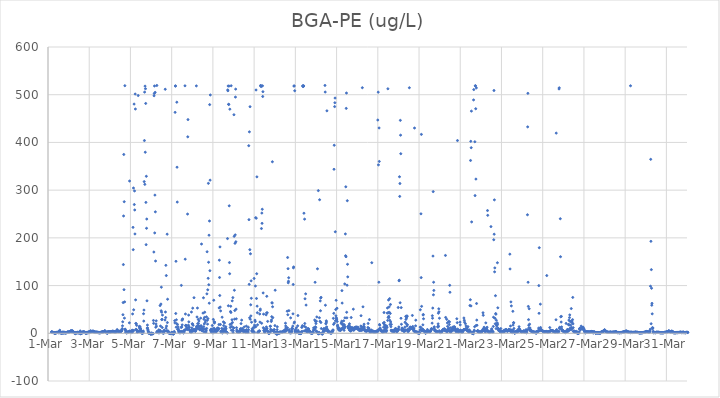
| Category | BGA-PE (ug/L) |
|---|---|
| 44986.166666666664 | 2.65 |
| 44986.177083333336 | 3.21 |
| 44986.1875 | 2.46 |
| 44986.197916666664 | 2.22 |
| 44986.208333333336 | 2.46 |
| 44986.21875 | 1.92 |
| 44986.229166666664 | 2.02 |
| 44986.239583333336 | 1.4 |
| 44986.25 | 1.86 |
| 44986.260416666664 | 1.52 |
| 44986.270833333336 | 1.32 |
| 44986.28125 | 1.61 |
| 44986.291666666664 | 1.69 |
| 44986.302083333336 | 1.04 |
| 44986.3125 | 0.11 |
| 44986.322916666664 | -0.11 |
| 44986.333333333336 | -0.01 |
| 44986.34375 | 0.42 |
| 44986.354166666664 | 1.64 |
| 44986.364583333336 | 0.75 |
| 44986.375 | 0.01 |
| 44986.385416666664 | 0.7 |
| 44986.395833333336 | 0.99 |
| 44986.40625 | 1.82 |
| 44986.416666666664 | 1.62 |
| 44986.427083333336 | 1.99 |
| 44986.4375 | 1.64 |
| 44986.447916666664 | 1.62 |
| 44986.458333333336 | 1.69 |
| 44986.46875 | 2.15 |
| 44986.479166666664 | 1.99 |
| 44986.489583333336 | 1.51 |
| 44986.5 | 2.55 |
| 44986.510416666664 | 2.75 |
| 44986.520833333336 | 3.06 |
| 44986.53125 | 0.52 |
| 44986.541666666664 | 2.72 |
| 44986.552083333336 | 3.44 |
| 44986.5625 | 3.37 |
| 44986.572916666664 | 6.44 |
| 44986.583333333336 | 2.01 |
| 44986.59375 | 1.48 |
| 44986.604166666664 | 1.84 |
| 44986.614583333336 | 1.39 |
| 44986.625 | 1.01 |
| 44986.635416666664 | 0.01 |
| 44986.645833333336 | 0.04 |
| 44986.65625 | 0.87 |
| 44986.666666666664 | 1.49 |
| 44986.677083333336 | 1.1 |
| 44986.6875 | 0.36 |
| 44986.697916666664 | 0.08 |
| 44986.708333333336 | 1.91 |
| 44986.71875 | 2.59 |
| 44986.729166666664 | 1.92 |
| 44986.739583333336 | 1.44 |
| 44986.75 | 1.84 |
| 44986.760416666664 | 0 |
| 44986.770833333336 | 2.47 |
| 44986.78125 | 2.14 |
| 44986.791666666664 | 1.79 |
| 44986.802083333336 | 0.89 |
| 44986.8125 | 1.61 |
| 44986.822916666664 | 1.21 |
| 44986.833333333336 | 1.58 |
| 44986.84375 | 0.33 |
| 44986.854166666664 | 0.81 |
| 44986.864583333336 | 0.7 |
| 44986.875 | 1.85 |
| 44986.885416666664 | 1.7 |
| 44986.895833333336 | 1.17 |
| 44986.90625 | 1.28 |
| 44986.916666666664 | 1.2 |
| 44986.927083333336 | 1.82 |
| 44986.9375 | 2.34 |
| 44986.947916666664 | 2.77 |
| 44986.958333333336 | 2.48 |
| 44986.96875 | 2.37 |
| 44986.979166666664 | 2.29 |
| 44986.989583333336 | 1.8 |
| 44987.0 | 2.6 |
| 44987.010416666664 | 2.54 |
| 44987.020833333336 | 3.18 |
| 44987.03125 | 2.92 |
| 44987.041666666664 | 3.11 |
| 44987.052083333336 | 3.05 |
| 44987.0625 | 3.44 |
| 44987.072916666664 | 3.9 |
| 44987.083333333336 | 4.03 |
| 44987.09375 | 3.89 |
| 44987.104166666664 | 5.21 |
| 44987.114583333336 | 4.47 |
| 44987.125 | 4.93 |
| 44987.135416666664 | 4.74 |
| 44987.145833333336 | 3.46 |
| 44987.15625 | 4.66 |
| 44987.166666666664 | 5.26 |
| 44987.177083333336 | 4.96 |
| 44987.1875 | 4.36 |
| 44987.197916666664 | 3.9 |
| 44987.208333333336 | 4.48 |
| 44987.21875 | 2.83 |
| 44987.229166666664 | 2.71 |
| 44987.239583333336 | 2.36 |
| 44987.25 | 2.07 |
| 44987.260416666664 | 1.85 |
| 44987.270833333336 | 0.59 |
| 44987.28125 | 1.47 |
| 44987.291666666664 | 0.73 |
| 44987.302083333336 | 0.65 |
| 44987.3125 | 0.38 |
| 44987.322916666664 | 0.08 |
| 44987.333333333336 | -0.8 |
| 44987.34375 | 1.55 |
| 44987.354166666664 | 0.52 |
| 44987.364583333336 | 1.13 |
| 44987.375 | 1.46 |
| 44987.385416666664 | 0.87 |
| 44987.395833333336 | 1.6 |
| 44987.40625 | 0.56 |
| 44987.416666666664 | 1.18 |
| 44987.427083333336 | 2.3 |
| 44987.4375 | 1.37 |
| 44987.447916666664 | 1.34 |
| 44987.458333333336 | 1.51 |
| 44987.46875 | 0.94 |
| 44987.479166666664 | 1.13 |
| 44987.489583333336 | 1.14 |
| 44987.5 | 0.95 |
| 44987.510416666664 | 1.22 |
| 44987.520833333336 | 1.56 |
| 44987.53125 | 1.76 |
| 44987.541666666664 | 0.38 |
| 44987.552083333336 | 1.67 |
| 44987.5625 | 5.04 |
| 44987.572916666664 | -1.1 |
| 44987.583333333336 | -0.13 |
| 44987.59375 | 0.17 |
| 44987.604166666664 | -0.16 |
| 44987.614583333336 | -0.27 |
| 44987.625 | -0.41 |
| 44987.635416666664 | 0.72 |
| 44987.645833333336 | 2.03 |
| 44987.65625 | 2.16 |
| 44987.666666666664 | 1.69 |
| 44987.677083333336 | 1.94 |
| 44987.6875 | 0.82 |
| 44987.697916666664 | 3.33 |
| 44987.708333333336 | 3.11 |
| 44987.71875 | 2.38 |
| 44987.729166666664 | 2.21 |
| 44987.739583333336 | 2.67 |
| 44987.75 | 2.46 |
| 44987.760416666664 | 2.42 |
| 44987.770833333336 | 2.4 |
| 44987.78125 | 2.02 |
| 44987.791666666664 | 2.4 |
| 44987.802083333336 | 1.1 |
| 44987.8125 | 1.39 |
| 44987.822916666664 | -0.25 |
| 44987.833333333336 | 1.07 |
| 44987.84375 | 1.47 |
| 44987.854166666664 | 0.29 |
| 44987.864583333336 | -0.19 |
| 44987.875 | 1.67 |
| 44987.885416666664 | 1.14 |
| 44987.895833333336 | 2.25 |
| 44987.90625 | 0.78 |
| 44987.916666666664 | 1.25 |
| 44987.927083333336 | 1.78 |
| 44987.9375 | 2.05 |
| 44987.947916666664 | 2.3 |
| 44987.958333333336 | 2.49 |
| 44987.96875 | 2.41 |
| 44987.979166666664 | 1.01 |
| 44987.989583333336 | 3.1 |
| 44988.0 | 1.34 |
| 44988.010416666664 | 2.17 |
| 44988.020833333336 | 2.51 |
| 44988.03125 | 2.75 |
| 44988.041666666664 | 2.16 |
| 44988.052083333336 | 4.57 |
| 44988.0625 | 4.63 |
| 44988.072916666664 | 3.98 |
| 44988.083333333336 | 4.91 |
| 44988.09375 | 3.74 |
| 44988.104166666664 | 3.57 |
| 44988.114583333336 | 3.41 |
| 44988.125 | 3.36 |
| 44988.135416666664 | 3.49 |
| 44988.145833333336 | 3.49 |
| 44988.15625 | 3.7 |
| 44988.166666666664 | 4.65 |
| 44988.177083333336 | 3.83 |
| 44988.1875 | 4.57 |
| 44988.197916666664 | 3.36 |
| 44988.208333333336 | 4.19 |
| 44988.21875 | 3.1 |
| 44988.229166666664 | 2.91 |
| 44988.239583333336 | 2.8 |
| 44988.25 | 2.64 |
| 44988.260416666664 | 2.56 |
| 44988.270833333336 | 2.18 |
| 44988.28125 | 2.68 |
| 44988.291666666664 | 2.24 |
| 44988.302083333336 | 2.65 |
| 44988.3125 | 2.02 |
| 44988.322916666664 | 1.62 |
| 44988.333333333336 | 1.99 |
| 44988.34375 | 2.38 |
| 44988.354166666664 | 2.13 |
| 44988.364583333336 | 2.04 |
| 44988.375 | 2.45 |
| 44988.385416666664 | 1.96 |
| 44988.395833333336 | 2 |
| 44988.40625 | 2.09 |
| 44988.416666666664 | 1.52 |
| 44988.427083333336 | 1.89 |
| 44988.4375 | 2.07 |
| 44988.447916666664 | 1.43 |
| 44988.458333333336 | 1.2 |
| 44988.46875 | 1.32 |
| 44988.479166666664 | 1.57 |
| 44988.489583333336 | 1.57 |
| 44988.5 | 0.94 |
| 44988.510416666664 | 0.91 |
| 44988.520833333336 | 1.27 |
| 44988.53125 | 0.91 |
| 44988.541666666664 | 1.95 |
| 44988.552083333336 | 1.36 |
| 44988.5625 | 1.92 |
| 44988.572916666664 | 1.5 |
| 44988.583333333336 | 2.46 |
| 44988.59375 | 2.43 |
| 44988.604166666664 | 2.22 |
| 44988.614583333336 | 2.14 |
| 44988.625 | 2.2 |
| 44988.635416666664 | 2.41 |
| 44988.645833333336 | 3.56 |
| 44988.65625 | 2.94 |
| 44988.666666666664 | 2.37 |
| 44988.677083333336 | 3.59 |
| 44988.6875 | 3.09 |
| 44988.697916666664 | 3.27 |
| 44988.708333333336 | 3.29 |
| 44988.71875 | 3.32 |
| 44988.729166666664 | 3.96 |
| 44988.739583333336 | 4.48 |
| 44988.75 | 4.94 |
| 44988.760416666664 | 5.27 |
| 44988.770833333336 | 4.58 |
| 44988.78125 | 3.84 |
| 44988.791666666664 | 3.78 |
| 44988.802083333336 | 2.95 |
| 44988.8125 | 2.11 |
| 44988.822916666664 | 1.61 |
| 44988.833333333336 | 0.95 |
| 44988.84375 | 1.76 |
| 44988.854166666664 | 1.3 |
| 44988.864583333336 | 1.98 |
| 44988.875 | -0.17 |
| 44988.885416666664 | 0.38 |
| 44988.895833333336 | 2.94 |
| 44988.90625 | 2.83 |
| 44988.916666666664 | 3.31 |
| 44988.927083333336 | 3.21 |
| 44988.9375 | 3.32 |
| 44988.947916666664 | 3.01 |
| 44988.958333333336 | 2.53 |
| 44988.96875 | 3.06 |
| 44988.979166666664 | 3.12 |
| 44988.989583333336 | 3.02 |
| 44989.0 | 3.16 |
| 44989.010416666664 | 2 |
| 44989.020833333336 | 2.98 |
| 44989.03125 | 2.76 |
| 44989.041666666664 | 3 |
| 44989.052083333336 | 3.13 |
| 44989.0625 | 3.1 |
| 44989.072916666664 | 3.66 |
| 44989.083333333336 | 3.66 |
| 44989.09375 | 3.22 |
| 44989.104166666664 | 3.3 |
| 44989.114583333336 | 3.47 |
| 44989.125 | 4.69 |
| 44989.135416666664 | 3.35 |
| 44989.145833333336 | 3.95 |
| 44989.15625 | 3.61 |
| 44989.166666666664 | 4.32 |
| 44989.177083333336 | 3.55 |
| 44989.1875 | 3.57 |
| 44989.197916666664 | 2.7 |
| 44989.208333333336 | 3.17 |
| 44989.21875 | 3.1 |
| 44989.229166666664 | 3.5 |
| 44989.239583333336 | 3.1 |
| 44989.25 | 2.36 |
| 44989.260416666664 | 2.83 |
| 44989.270833333336 | 3.49 |
| 44989.28125 | 3.33 |
| 44989.291666666664 | 2.37 |
| 44989.302083333336 | 2.75 |
| 44989.3125 | 3.56 |
| 44989.322916666664 | 4.86 |
| 44989.333333333336 | 5.21 |
| 44989.34375 | 5.58 |
| 44989.354166666664 | 7.77 |
| 44989.364583333336 | 5.84 |
| 44989.375 | 4.72 |
| 44989.385416666664 | 4.54 |
| 44989.395833333336 | 4.49 |
| 44989.40625 | 4.36 |
| 44989.416666666664 | 3.86 |
| 44989.427083333336 | 3.71 |
| 44989.4375 | 3.53 |
| 44989.447916666664 | 4.09 |
| 44989.458333333336 | 4.21 |
| 44989.46875 | 3.83 |
| 44989.479166666664 | 3.75 |
| 44989.489583333336 | 4.05 |
| 44989.5 | 3.93 |
| 44989.510416666664 | 3.65 |
| 44989.520833333336 | 4.3 |
| 44989.53125 | 4.52 |
| 44989.541666666664 | 4.03 |
| 44989.552083333336 | 4.29 |
| 44989.5625 | 4.92 |
| 44989.572916666664 | 5.7 |
| 44989.583333333336 | 7.57 |
| 44989.59375 | 7 |
| 44989.604166666664 | 9.82 |
| 44989.614583333336 | 15.61 |
| 44989.625 | 24.05 |
| 44989.635416666664 | 38.92 |
| 44989.645833333336 | 64.4 |
| 44989.65625 | 144.03 |
| 44989.666666666664 | 245.85 |
| 44989.677083333336 | 374.78 |
| 44989.6875 | 91.42 |
| 44989.697916666664 | 275.77 |
| 44989.708333333336 | 31.78 |
| 44989.71875 | 65.8 |
| 44989.729166666664 | 518.9 |
| 44989.739583333336 | 8.64 |
| 44989.75 | 7.96 |
| 44989.760416666664 | 6.03 |
| 44989.770833333336 | 2.11 |
| 44989.78125 | 3.01 |
| 44989.791666666664 | 2.38 |
| 44989.802083333336 | 3.67 |
| 44989.8125 | 1.01 |
| 44989.822916666664 | 0.64 |
| 44989.833333333336 | 2.15 |
| 44989.84375 | 1.63 |
| 44989.854166666664 | 1.84 |
| 44989.864583333336 | 2.96 |
| 44989.875 | 2.8 |
| 44989.885416666664 | 2.49 |
| 44989.895833333336 | 2.37 |
| 44989.90625 | 2.85 |
| 44989.916666666664 | 2.67 |
| 44989.927083333336 | 3.3 |
| 44989.9375 | 4.19 |
| 44989.947916666664 | 21.91 |
| 44989.958333333336 | 319.12 |
| 44989.96875 | 4.84 |
| 44989.979166666664 | 2.32 |
| 44989.989583333336 | 3.36 |
| 44990.0 | 2.5 |
| 44990.010416666664 | 3.06 |
| 44990.020833333336 | 1.87 |
| 44990.03125 | 1.73 |
| 44990.041666666664 | 2 |
| 44990.052083333336 | 1.8 |
| 44990.0625 | 1.36 |
| 44990.072916666664 | 2 |
| 44990.083333333336 | 6.52 |
| 44990.09375 | 5.81 |
| 44990.104166666664 | 40.53 |
| 44990.114583333336 | 3.84 |
| 44990.125 | 221.97 |
| 44990.135416666664 | 175.24 |
| 44990.145833333336 | 304.45 |
| 44990.15625 | 49.2 |
| 44990.166666666664 | 6.11 |
| 44990.177083333336 | 480.39 |
| 44990.1875 | 269.82 |
| 44990.197916666664 | 298.39 |
| 44990.208333333336 | 258.45 |
| 44990.21875 | 208.17 |
| 44990.229166666664 | 501.42 |
| 44990.239583333336 | 470.03 |
| 44990.25 | 69.97 |
| 44990.260416666664 | 20.74 |
| 44990.270833333336 | 8.58 |
| 44990.28125 | 19.97 |
| 44990.291666666664 | 7.06 |
| 44990.302083333336 | 16.57 |
| 44990.3125 | 6.4 |
| 44990.322916666664 | 2.89 |
| 44990.333333333336 | 2.33 |
| 44990.34375 | 2.75 |
| 44990.354166666664 | 2.98 |
| 44990.364583333336 | 3.37 |
| 44990.375 | 498.29 |
| 44990.385416666664 | 4.03 |
| 44990.395833333336 | 3.64 |
| 44990.40625 | 4.28 |
| 44990.416666666664 | 3.75 |
| 44990.427083333336 | 13.27 |
| 44990.4375 | 14.59 |
| 44990.447916666664 | 10.23 |
| 44990.458333333336 | 13.56 |
| 44990.46875 | 12.9 |
| 44990.479166666664 | 9.9 |
| 44990.489583333336 | 9.27 |
| 44990.5 | 6.28 |
| 44990.510416666664 | 6.41 |
| 44990.520833333336 | 4.35 |
| 44990.53125 | 3.74 |
| 44990.541666666664 | 2.86 |
| 44990.552083333336 | 0.06 |
| 44990.5625 | 0.25 |
| 44990.572916666664 | 0.98 |
| 44990.583333333336 | 0.39 |
| 44990.59375 | -0.22 |
| 44990.604166666664 | 3.86 |
| 44990.614583333336 | 1.67 |
| 44990.625 | 4.6 |
| 44990.635416666664 | 40.98 |
| 44990.645833333336 | 25.55 |
| 44990.65625 | 48.69 |
| 44990.666666666664 | 317.88 |
| 44990.677083333336 | 403.95 |
| 44990.6875 | 505.45 |
| 44990.697916666664 | 312.11 |
| 44990.708333333336 | 517.99 |
| 44990.71875 | 379.49 |
| 44990.729166666664 | 512.59 |
| 44990.739583333336 | 481.73 |
| 44990.75 | 274.3 |
| 44990.760416666664 | 185.74 |
| 44990.770833333336 | 329.02 |
| 44990.78125 | 220.04 |
| 44990.791666666664 | 239.44 |
| 44990.802083333336 | 68.03 |
| 44990.8125 | 10.92 |
| 44990.822916666664 | 17.24 |
| 44990.833333333336 | 11.04 |
| 44990.84375 | 7.66 |
| 44990.854166666664 | 5.91 |
| 44990.864583333336 | 3.51 |
| 44990.875 | 0.44 |
| 44990.885416666664 | 0.32 |
| 44990.895833333336 | 1.13 |
| 44990.90625 | 0.56 |
| 44990.916666666664 | 0.13 |
| 44990.927083333336 | 0.63 |
| 44990.9375 | 0.2 |
| 44990.947916666664 | 0.55 |
| 44990.958333333336 | -0.44 |
| 44990.96875 | -1.34 |
| 44990.979166666664 | -1.2 |
| 44990.989583333336 | -1.79 |
| 44991.0 | -1.29 |
| 44991.010416666664 | -1.83 |
| 44991.020833333336 | -0.73 |
| 44991.03125 | 0.71 |
| 44991.041666666664 | -0.02 |
| 44991.052083333336 | -0.14 |
| 44991.0625 | -0.71 |
| 44991.072916666664 | -1.3 |
| 44991.083333333336 | -1 |
| 44991.09375 | -0.72 |
| 44991.104166666664 | -0.79 |
| 44991.114583333336 | 26.86 |
| 44991.125 | 20.79 |
| 44991.135416666664 | 170.3 |
| 44991.145833333336 | 497.78 |
| 44991.15625 | 502.53 |
| 44991.166666666664 | 518.32 |
| 44991.177083333336 | 210.35 |
| 44991.1875 | 289.61 |
| 44991.197916666664 | 504.91 |
| 44991.208333333336 | 254.52 |
| 44991.21875 | 151.47 |
| 44991.229166666664 | 12.63 |
| 44991.239583333336 | 19.53 |
| 44991.25 | 26.09 |
| 44991.260416666664 | 14.97 |
| 44991.270833333336 | 1.97 |
| 44991.28125 | 519.37 |
| 44991.291666666664 | 4.08 |
| 44991.302083333336 | 1.91 |
| 44991.3125 | 2.27 |
| 44991.322916666664 | 2.67 |
| 44991.333333333336 | 1.9 |
| 44991.34375 | 1.92 |
| 44991.354166666664 | 1.51 |
| 44991.364583333336 | 1.08 |
| 44991.375 | 7.2 |
| 44991.385416666664 | 2.48 |
| 44991.395833333336 | 0.89 |
| 44991.40625 | 2.73 |
| 44991.416666666664 | 6.02 |
| 44991.427083333336 | 5.08 |
| 44991.4375 | 58.11 |
| 44991.447916666664 | 5.6 |
| 44991.458333333336 | 15.16 |
| 44991.46875 | 3.37 |
| 44991.479166666664 | 61.28 |
| 44991.489583333336 | 47.13 |
| 44991.5 | 96.57 |
| 44991.510416666664 | 44.29 |
| 44991.520833333336 | 28.54 |
| 44991.53125 | 29.37 |
| 44991.541666666664 | 12.07 |
| 44991.552083333336 | 38.17 |
| 44991.5625 | 3.33 |
| 44991.572916666664 | 0.59 |
| 44991.583333333336 | 0.57 |
| 44991.59375 | 0.65 |
| 44991.604166666664 | 0.77 |
| 44991.614583333336 | 1.05 |
| 44991.625 | 0.47 |
| 44991.635416666664 | 6.55 |
| 44991.645833333336 | 4.7 |
| 44991.65625 | 4.84 |
| 44991.666666666664 | 5.19 |
| 44991.677083333336 | 27.82 |
| 44991.6875 | 511.41 |
| 44991.697916666664 | 44.58 |
| 44991.708333333336 | 32.98 |
| 44991.71875 | 142.45 |
| 44991.729166666664 | 10.9 |
| 44991.739583333336 | 120.94 |
| 44991.75 | 15.14 |
| 44991.760416666664 | 5.21 |
| 44991.770833333336 | 4.63 |
| 44991.78125 | 207.72 |
| 44991.791666666664 | 22.5 |
| 44991.802083333336 | 71.37 |
| 44991.8125 | 4.96 |
| 44991.822916666664 | 4.67 |
| 44991.833333333336 | 2.73 |
| 44991.84375 | 2.08 |
| 44991.854166666664 | 0.78 |
| 44991.864583333336 | 1.33 |
| 44991.875 | 0.93 |
| 44991.885416666664 | 0.1 |
| 44991.895833333336 | -0.13 |
| 44991.90625 | 0.2 |
| 44991.916666666664 | -0.44 |
| 44991.927083333336 | -0.47 |
| 44991.9375 | -0.72 |
| 44991.947916666664 | -0.3 |
| 44991.958333333336 | -0.4 |
| 44991.96875 | -0.46 |
| 44991.979166666664 | 1.31 |
| 44991.989583333336 | 0.9 |
| 44992.0 | 1.02 |
| 44992.010416666664 | 0.68 |
| 44992.020833333336 | 1.54 |
| 44992.03125 | 1.61 |
| 44992.041666666664 | 0.64 |
| 44992.052083333336 | -0.17 |
| 44992.0625 | -0.99 |
| 44992.072916666664 | -1.92 |
| 44992.083333333336 | -0.41 |
| 44992.09375 | -1.26 |
| 44992.104166666664 | -0.68 |
| 44992.114583333336 | 0.69 |
| 44992.125 | 3.73 |
| 44992.135416666664 | 1.41 |
| 44992.145833333336 | 26.33 |
| 44992.15625 | 21.73 |
| 44992.166666666664 | 463.06 |
| 44992.177083333336 | 518.3 |
| 44992.1875 | 518.28 |
| 44992.197916666664 | 41.48 |
| 44992.208333333336 | 150.86 |
| 44992.21875 | 12.74 |
| 44992.229166666664 | 28.23 |
| 44992.239583333336 | 20.29 |
| 44992.25 | 484.32 |
| 44992.260416666664 | 348.06 |
| 44992.270833333336 | 274.99 |
| 44992.28125 | 18.41 |
| 44992.291666666664 | 8.28 |
| 44992.302083333336 | 8.33 |
| 44992.3125 | 13.35 |
| 44992.322916666664 | 9.05 |
| 44992.333333333336 | 6.26 |
| 44992.34375 | 3.52 |
| 44992.354166666664 | 2.85 |
| 44992.364583333336 | 2.1 |
| 44992.375 | 1.2 |
| 44992.385416666664 | 4.1 |
| 44992.395833333336 | 1.26 |
| 44992.40625 | 1.42 |
| 44992.416666666664 | 1.31 |
| 44992.427083333336 | 1.42 |
| 44992.4375 | 2.77 |
| 44992.447916666664 | 3.35 |
| 44992.458333333336 | 12.26 |
| 44992.46875 | 100.4 |
| 44992.479166666664 | 3.82 |
| 44992.489583333336 | 13.08 |
| 44992.5 | 27.41 |
| 44992.510416666664 | 17.62 |
| 44992.520833333336 | 28.79 |
| 44992.53125 | 30.12 |
| 44992.541666666664 | 4.03 |
| 44992.552083333336 | 1.55 |
| 44992.5625 | 1.24 |
| 44992.572916666664 | 0.82 |
| 44992.583333333336 | 1.25 |
| 44992.59375 | 2.22 |
| 44992.604166666664 | 4.28 |
| 44992.614583333336 | 6.09 |
| 44992.625 | 6.16 |
| 44992.635416666664 | 6.9 |
| 44992.645833333336 | 518.68 |
| 44992.65625 | 155.31 |
| 44992.666666666664 | 40.41 |
| 44992.677083333336 | 16.08 |
| 44992.6875 | 16.74 |
| 44992.697916666664 | 15.61 |
| 44992.708333333336 | 15.28 |
| 44992.71875 | 8.96 |
| 44992.729166666664 | 11.01 |
| 44992.739583333336 | 11.61 |
| 44992.75 | 8.92 |
| 44992.760416666664 | 7.7 |
| 44992.770833333336 | 249.86 |
| 44992.78125 | 411.74 |
| 44992.791666666664 | 447.84 |
| 44992.802083333336 | 11.77 |
| 44992.8125 | 16.97 |
| 44992.822916666664 | 38.1 |
| 44992.833333333336 | 23.99 |
| 44992.84375 | 12.93 |
| 44992.854166666664 | 12.5 |
| 44992.864583333336 | 7.28 |
| 44992.875 | 6.88 |
| 44992.885416666664 | 5.96 |
| 44992.895833333336 | 4.95 |
| 44992.90625 | 4.15 |
| 44992.916666666664 | 2.59 |
| 44992.927083333336 | 2.26 |
| 44992.9375 | 1.73 |
| 44992.947916666664 | 1.5 |
| 44992.958333333336 | 44.55 |
| 44992.96875 | 6.13 |
| 44992.979166666664 | 11.12 |
| 44992.989583333336 | 5.85 |
| 44993.0 | 20.01 |
| 44993.010416666664 | 19.32 |
| 44993.020833333336 | 52.68 |
| 44993.03125 | 4.23 |
| 44993.041666666664 | 16.76 |
| 44993.052083333336 | 6.59 |
| 44993.0625 | 6.97 |
| 44993.072916666664 | 8.04 |
| 44993.083333333336 | 74.61 |
| 44993.09375 | 6.68 |
| 44993.104166666664 | 6.62 |
| 44993.114583333336 | 6.68 |
| 44993.125 | 5.89 |
| 44993.135416666664 | 6.52 |
| 44993.145833333336 | 3.91 |
| 44993.15625 | 5.29 |
| 44993.166666666664 | 5.23 |
| 44993.177083333336 | 9.49 |
| 44993.1875 | 9.77 |
| 44993.197916666664 | 518.48 |
| 44993.208333333336 | 14.25 |
| 44993.21875 | 13.38 |
| 44993.229166666664 | 34.21 |
| 44993.239583333336 | 9.3 |
| 44993.25 | 52.91 |
| 44993.260416666664 | 20.2 |
| 44993.270833333336 | 14.56 |
| 44993.28125 | 15.32 |
| 44993.291666666664 | 29.14 |
| 44993.302083333336 | 20.58 |
| 44993.3125 | 13 |
| 44993.322916666664 | 25.76 |
| 44993.333333333336 | 14.58 |
| 44993.34375 | 8.65 |
| 44993.354166666664 | 8.94 |
| 44993.364583333336 | 7.66 |
| 44993.375 | 7.01 |
| 44993.385416666664 | 15.05 |
| 44993.395833333336 | 9.33 |
| 44993.40625 | 31.69 |
| 44993.416666666664 | 8.93 |
| 44993.427083333336 | 15.73 |
| 44993.4375 | 14.64 |
| 44993.447916666664 | 187.03 |
| 44993.458333333336 | 10.78 |
| 44993.46875 | 10.88 |
| 44993.479166666664 | 5.11 |
| 44993.489583333336 | 5.55 |
| 44993.5 | 7.52 |
| 44993.510416666664 | 8.77 |
| 44993.520833333336 | 42.3 |
| 44993.53125 | 8.18 |
| 44993.541666666664 | 74.4 |
| 44993.552083333336 | 13.61 |
| 44993.5625 | 29.55 |
| 44993.572916666664 | 2.77 |
| 44993.583333333336 | 19.58 |
| 44993.59375 | 33.29 |
| 44993.604166666664 | 44.16 |
| 44993.614583333336 | 8.3 |
| 44993.625 | 23.02 |
| 44993.635416666664 | 2.62 |
| 44993.645833333336 | 26.67 |
| 44993.65625 | 8.94 |
| 44993.666666666664 | 2.51 |
| 44993.677083333336 | 5.32 |
| 44993.6875 | 34.47 |
| 44993.697916666664 | 10.03 |
| 44993.708333333336 | 82.65 |
| 44993.71875 | 170.86 |
| 44993.729166666664 | 27.09 |
| 44993.739583333336 | 19.18 |
| 44993.75 | 91.12 |
| 44993.760416666664 | 30.78 |
| 44993.770833333336 | 115.21 |
| 44993.78125 | 314.24 |
| 44993.791666666664 | 148.8 |
| 44993.802083333336 | 101.78 |
| 44993.8125 | 205.57 |
| 44993.822916666664 | 63.09 |
| 44993.833333333336 | 235.35 |
| 44993.84375 | 479.24 |
| 44993.854166666664 | 131.16 |
| 44993.864583333336 | 320.92 |
| 44993.875 | 499.49 |
| 44993.885416666664 | 6.77 |
| 44993.895833333336 | 6.44 |
| 44993.90625 | 3.24 |
| 44993.916666666664 | 8.8 |
| 44993.927083333336 | 5.25 |
| 44993.9375 | 7.38 |
| 44993.947916666664 | 2.79 |
| 44993.958333333336 | 3.35 |
| 44993.96875 | 16.32 |
| 44993.979166666664 | 1.18 |
| 44993.989583333336 | 8.74 |
| 44994.0 | 2.46 |
| 44994.010416666664 | 4.15 |
| 44994.020833333336 | 29.04 |
| 44994.03125 | 1.25 |
| 44994.041666666664 | 69.24 |
| 44994.052083333336 | 10.78 |
| 44994.0625 | 24.08 |
| 44994.072916666664 | 21.48 |
| 44994.083333333336 | 23.3 |
| 44994.09375 | 6.67 |
| 44994.104166666664 | 7.33 |
| 44994.114583333336 | 7.5 |
| 44994.125 | 3.59 |
| 44994.135416666664 | 3.62 |
| 44994.145833333336 | 2.71 |
| 44994.15625 | 3.59 |
| 44994.166666666664 | 3.48 |
| 44994.177083333336 | 5.1 |
| 44994.1875 | 6.36 |
| 44994.197916666664 | 6.48 |
| 44994.208333333336 | 5.84 |
| 44994.21875 | 11.17 |
| 44994.229166666664 | 9.23 |
| 44994.239583333336 | 9.79 |
| 44994.25 | 6.46 |
| 44994.260416666664 | 9.52 |
| 44994.270833333336 | 10.62 |
| 44994.28125 | 9 |
| 44994.291666666664 | 18.3 |
| 44994.302083333336 | 53.13 |
| 44994.3125 | 153.21 |
| 44994.322916666664 | 116.94 |
| 44994.333333333336 | 79.18 |
| 44994.34375 | 181.03 |
| 44994.354166666664 | 54.91 |
| 44994.364583333336 | 18.46 |
| 44994.375 | 46.9 |
| 44994.385416666664 | 3.31 |
| 44994.395833333336 | 3.86 |
| 44994.40625 | 1.68 |
| 44994.416666666664 | 4.66 |
| 44994.427083333336 | 10.03 |
| 44994.4375 | 4.64 |
| 44994.447916666664 | 33.7 |
| 44994.458333333336 | 0.44 |
| 44994.46875 | 3.33 |
| 44994.479166666664 | 5.64 |
| 44994.489583333336 | 2.73 |
| 44994.5 | 9.41 |
| 44994.510416666664 | 23.92 |
| 44994.520833333336 | 16.16 |
| 44994.53125 | 4.22 |
| 44994.541666666664 | 7.23 |
| 44994.552083333336 | 3.63 |
| 44994.5625 | 21.72 |
| 44994.572916666664 | 6.57 |
| 44994.583333333336 | 9.84 |
| 44994.59375 | 9.85 |
| 44994.604166666664 | 5.39 |
| 44994.614583333336 | 8.05 |
| 44994.625 | 13.67 |
| 44994.635416666664 | 9.97 |
| 44994.645833333336 | 2.2 |
| 44994.65625 | 2.32 |
| 44994.666666666664 | 1.8 |
| 44994.677083333336 | 1.82 |
| 44994.6875 | 1.32 |
| 44994.697916666664 | 0.5 |
| 44994.708333333336 | 198.44 |
| 44994.71875 | 510.07 |
| 44994.729166666664 | 508.3 |
| 44994.739583333336 | 518.28 |
| 44994.75 | 57.68 |
| 44994.760416666664 | 479.9 |
| 44994.770833333336 | 479.47 |
| 44994.78125 | 518.12 |
| 44994.791666666664 | 267.15 |
| 44994.802083333336 | 148.21 |
| 44994.8125 | 124.84 |
| 44994.822916666664 | 469.69 |
| 44994.833333333336 | 18.4 |
| 44994.84375 | 12.18 |
| 44994.854166666664 | 45.57 |
| 44994.864583333336 | 56.67 |
| 44994.875 | 43.64 |
| 44994.885416666664 | 518.76 |
| 44994.895833333336 | 6.31 |
| 44994.90625 | 20.35 |
| 44994.916666666664 | 14.19 |
| 44994.927083333336 | 28.34 |
| 44994.9375 | 67.95 |
| 44994.947916666664 | 22.72 |
| 44994.958333333336 | 6.65 |
| 44994.96875 | 74.77 |
| 44994.979166666664 | 1.3 |
| 44994.989583333336 | 5.49 |
| 44995.0 | 11.35 |
| 44995.010416666664 | 11.44 |
| 44995.020833333336 | 458.05 |
| 44995.03125 | 203.2 |
| 44995.041666666664 | 90.13 |
| 44995.052083333336 | 29.67 |
| 44995.0625 | 47.76 |
| 44995.072916666664 | 188.52 |
| 44995.083333333336 | 206.26 |
| 44995.09375 | 495.02 |
| 44995.104166666664 | 511.7 |
| 44995.114583333336 | 191.83 |
| 44995.125 | 50.6 |
| 44995.135416666664 | 30.33 |
| 44995.145833333336 | 11.77 |
| 44995.15625 | 6.79 |
| 44995.166666666664 | 4.05 |
| 44995.177083333336 | 2.85 |
| 44995.1875 | 3.13 |
| 44995.197916666664 | 3.22 |
| 44995.208333333336 | 2.54 |
| 44995.21875 | 2.83 |
| 44995.229166666664 | 3.12 |
| 44995.239583333336 | 2.05 |
| 44995.25 | 2.84 |
| 44995.260416666664 | 2.86 |
| 44995.270833333336 | 2.28 |
| 44995.28125 | 3.05 |
| 44995.291666666664 | 2.68 |
| 44995.302083333336 | 3.63 |
| 44995.3125 | 4.98 |
| 44995.322916666664 | 8.72 |
| 44995.333333333336 | 5.92 |
| 44995.34375 | 9.51 |
| 44995.354166666664 | 8.81 |
| 44995.364583333336 | 20.26 |
| 44995.375 | 8.08 |
| 44995.385416666664 | 8.63 |
| 44995.395833333336 | 27.61 |
| 44995.40625 | 4.69 |
| 44995.416666666664 | 7.29 |
| 44995.427083333336 | 9.96 |
| 44995.4375 | 5.51 |
| 44995.447916666664 | 6.02 |
| 44995.458333333336 | 6.89 |
| 44995.46875 | 7.21 |
| 44995.479166666664 | 6.24 |
| 44995.489583333336 | 3.07 |
| 44995.5 | 3.49 |
| 44995.510416666664 | 4.88 |
| 44995.520833333336 | 13.38 |
| 44995.53125 | 4.17 |
| 44995.541666666664 | 4.05 |
| 44995.552083333336 | 5.36 |
| 44995.5625 | 3.99 |
| 44995.572916666664 | 5.16 |
| 44995.583333333336 | 5.01 |
| 44995.59375 | 1.55 |
| 44995.604166666664 | 5.6 |
| 44995.614583333336 | 3.28 |
| 44995.625 | 14.98 |
| 44995.635416666664 | 7.63 |
| 44995.645833333336 | 2.22 |
| 44995.65625 | 2.36 |
| 44995.666666666664 | 2.42 |
| 44995.677083333336 | 1.93 |
| 44995.6875 | 2.09 |
| 44995.697916666664 | 1.65 |
| 44995.708333333336 | 4.43 |
| 44995.71875 | 12.75 |
| 44995.729166666664 | 7.55 |
| 44995.739583333336 | 393.17 |
| 44995.75 | 238.14 |
| 44995.760416666664 | 102.56 |
| 44995.770833333336 | 422.16 |
| 44995.78125 | 32.53 |
| 44995.791666666664 | 175.2 |
| 44995.802083333336 | 474.9 |
| 44995.8125 | 29.52 |
| 44995.822916666664 | 166.63 |
| 44995.833333333336 | 59.68 |
| 44995.84375 | 36.42 |
| 44995.854166666664 | 109.91 |
| 44995.864583333336 | 73.33 |
| 44995.875 | 23.19 |
| 44995.885416666664 | 5.1 |
| 44995.895833333336 | 4.74 |
| 44995.90625 | 9.57 |
| 44995.916666666664 | 3.45 |
| 44995.927083333336 | 7.09 |
| 44995.9375 | 4.99 |
| 44995.947916666664 | 3.08 |
| 44995.958333333336 | 2.99 |
| 44995.96875 | 12.3 |
| 44995.979166666664 | 2.93 |
| 44995.989583333336 | 2.61 |
| 44996.0 | 114.89 |
| 44996.010416666664 | 2.11 |
| 44996.020833333336 | 17.1 |
| 44996.03125 | 12.53 |
| 44996.041666666664 | 27.47 |
| 44996.052083333336 | 24.57 |
| 44996.0625 | 99.09 |
| 44996.072916666664 | 242.25 |
| 44996.083333333336 | 14.1 |
| 44996.09375 | 509.91 |
| 44996.104166666664 | 241.22 |
| 44996.114583333336 | 72.97 |
| 44996.125 | 124.83 |
| 44996.135416666664 | 327.84 |
| 44996.145833333336 | 56.85 |
| 44996.15625 | 43.1 |
| 44996.166666666664 | 17.78 |
| 44996.177083333336 | 2.41 |
| 44996.1875 | 1.32 |
| 44996.197916666664 | 1.88 |
| 44996.208333333336 | 3.35 |
| 44996.21875 | 3.35 |
| 44996.229166666664 | 4.39 |
| 44996.239583333336 | 4.43 |
| 44996.25 | 4.74 |
| 44996.260416666664 | 4.78 |
| 44996.270833333336 | 40.46 |
| 44996.28125 | 23.46 |
| 44996.291666666664 | 48.12 |
| 44996.302083333336 | 50.7 |
| 44996.3125 | 519.24 |
| 44996.322916666664 | 518.16 |
| 44996.333333333336 | 518.87 |
| 44996.34375 | 517.04 |
| 44996.354166666664 | 219.52 |
| 44996.364583333336 | 20.97 |
| 44996.375 | 251.94 |
| 44996.385416666664 | 230.42 |
| 44996.395833333336 | 259.91 |
| 44996.40625 | 518.65 |
| 44996.416666666664 | 496.26 |
| 44996.427083333336 | 506.34 |
| 44996.4375 | 84.54 |
| 44996.447916666664 | 11.71 |
| 44996.458333333336 | 40.17 |
| 44996.46875 | 5.63 |
| 44996.479166666664 | 9.44 |
| 44996.489583333336 | 5.41 |
| 44996.5 | 3 |
| 44996.510416666664 | 5.48 |
| 44996.520833333336 | 1.82 |
| 44996.53125 | 5.05 |
| 44996.541666666664 | 5.91 |
| 44996.552083333336 | 5.2 |
| 44996.5625 | 7.54 |
| 44996.572916666664 | 8.43 |
| 44996.583333333336 | 38.69 |
| 44996.59375 | 13.36 |
| 44996.604166666664 | 42.79 |
| 44996.614583333336 | 77.52 |
| 44996.625 | 10.11 |
| 44996.635416666664 | 43 |
| 44996.645833333336 | 5.29 |
| 44996.65625 | 24.94 |
| 44996.666666666664 | 3.51 |
| 44996.677083333336 | 2.98 |
| 44996.6875 | 0.74 |
| 44996.697916666664 | 0.41 |
| 44996.708333333336 | -0.24 |
| 44996.71875 | 0.02 |
| 44996.729166666664 | 0.44 |
| 44996.739583333336 | 0.56 |
| 44996.75 | 1.54 |
| 44996.760416666664 | 1.08 |
| 44996.770833333336 | 0.97 |
| 44996.78125 | 14.62 |
| 44996.791666666664 | 14.64 |
| 44996.802083333336 | 8.51 |
| 44996.8125 | 6.32 |
| 44996.822916666664 | 5.05 |
| 44996.833333333336 | 24.77 |
| 44996.84375 | 27.86 |
| 44996.854166666664 | 34.84 |
| 44996.864583333336 | 63.97 |
| 44996.875 | 63.34 |
| 44996.885416666664 | 359.47 |
| 44996.895833333336 | 55.59 |
| 44996.90625 | 32.74 |
| 44996.916666666664 | 6.48 |
| 44996.927083333336 | 5.87 |
| 44996.9375 | 4.84 |
| 44996.947916666664 | 3.69 |
| 44996.958333333336 | 3.91 |
| 44996.96875 | 7.56 |
| 44996.979166666664 | 7.46 |
| 44996.989583333336 | 1.77 |
| 44997.0 | 1.18 |
| 44997.010416666664 | 16.09 |
| 44997.020833333336 | 90.29 |
| 44997.03125 | 1.84 |
| 44997.041666666664 | 2.09 |
| 44997.052083333336 | 0.28 |
| 44997.0625 | -0.18 |
| 44997.072916666664 | 0.4 |
| 44997.083333333336 | 0.78 |
| 44997.09375 | 0.51 |
| 44997.104166666664 | -2.46 |
| 44997.114583333336 | 7.71 |
| 44997.125 | 13.56 |
| 44997.135416666664 | 2.93 |
| 44997.145833333336 | 1.47 |
| 44997.15625 | -0.78 |
| 44997.166666666664 | 0.93 |
| 44997.177083333336 | 1.08 |
| 44997.1875 | 0.88 |
| 44997.197916666664 | 1.44 |
| 44997.208333333336 | 1.41 |
| 44997.21875 | 0.21 |
| 44997.229166666664 | 0.45 |
| 44997.239583333336 | 1.86 |
| 44997.25 | 3.01 |
| 44997.260416666664 | 0.9 |
| 44997.270833333336 | 2.38 |
| 44997.28125 | 2 |
| 44997.291666666664 | 1.72 |
| 44997.302083333336 | 2.71 |
| 44997.3125 | 2.35 |
| 44997.322916666664 | 1.83 |
| 44997.333333333336 | 2.33 |
| 44997.34375 | 1.82 |
| 44997.354166666664 | 2.19 |
| 44997.364583333336 | 1.69 |
| 44997.375 | 2.47 |
| 44997.385416666664 | 3 |
| 44997.395833333336 | 3.16 |
| 44997.40625 | 3.4 |
| 44997.416666666664 | 4.89 |
| 44997.427083333336 | 4.46 |
| 44997.4375 | 4.41 |
| 44997.447916666664 | 3.8 |
| 44997.458333333336 | 4.17 |
| 44997.46875 | 5.02 |
| 44997.479166666664 | 5.14 |
| 44997.489583333336 | 3.63 |
| 44997.5 | 3.56 |
| 44997.510416666664 | 7.92 |
| 44997.520833333336 | 21.17 |
| 44997.53125 | 15.38 |
| 44997.541666666664 | 11.26 |
| 44997.552083333336 | 7.83 |
| 44997.5625 | 4.87 |
| 44997.572916666664 | 6.67 |
| 44997.583333333336 | 8.88 |
| 44997.59375 | 7.32 |
| 44997.604166666664 | 46.3 |
| 44997.614583333336 | 11.66 |
| 44997.625 | 158.84 |
| 44997.635416666664 | 38.9 |
| 44997.645833333336 | 135.41 |
| 44997.65625 | 105.85 |
| 44997.666666666664 | 109 |
| 44997.677083333336 | 116.43 |
| 44997.6875 | 47.42 |
| 44997.697916666664 | 7.54 |
| 44997.708333333336 | 6.5 |
| 44997.71875 | 3.22 |
| 44997.729166666664 | 1.14 |
| 44997.739583333336 | 1.44 |
| 44997.75 | 0.88 |
| 44997.760416666664 | 1.1 |
| 44997.770833333336 | 32.34 |
| 44997.78125 | 1.84 |
| 44997.791666666664 | 0.73 |
| 44997.802083333336 | 1.77 |
| 44997.8125 | 3.94 |
| 44997.822916666664 | 4.6 |
| 44997.833333333336 | 9.94 |
| 44997.84375 | 10.16 |
| 44997.854166666664 | 9.81 |
| 44997.864583333336 | 9.66 |
| 44997.875 | 14.96 |
| 44997.885416666664 | 40.74 |
| 44997.895833333336 | 102.34 |
| 44997.90625 | 137.13 |
| 44997.916666666664 | 139.04 |
| 44997.927083333336 | 518.18 |
| 44997.9375 | 21.44 |
| 44997.947916666664 | 518.41 |
| 44997.958333333336 | 23.47 |
| 44997.96875 | 508.31 |
| 44997.979166666664 | 5.25 |
| 44997.989583333336 | 4.16 |
| 44998.0 | 1.15 |
| 44998.010416666664 | 8.07 |
| 44998.020833333336 | 4.41 |
| 44998.03125 | 3 |
| 44998.041666666664 | 1.31 |
| 44998.052083333336 | 11.49 |
| 44998.0625 | 2.54 |
| 44998.072916666664 | 3.89 |
| 44998.083333333336 | 1.25 |
| 44998.09375 | 2.32 |
| 44998.104166666664 | 2.1 |
| 44998.114583333336 | 15.66 |
| 44998.125 | 37.24 |
| 44998.135416666664 | 6.05 |
| 44998.145833333336 | 1.5 |
| 44998.15625 | 0.71 |
| 44998.166666666664 | 1.06 |
| 44998.177083333336 | 1.15 |
| 44998.1875 | -0.23 |
| 44998.197916666664 | -0.22 |
| 44998.208333333336 | -0.39 |
| 44998.21875 | 0.16 |
| 44998.229166666664 | 2.22 |
| 44998.239583333336 | 0.6 |
| 44998.25 | -0.67 |
| 44998.260416666664 | -0.25 |
| 44998.270833333336 | -0.05 |
| 44998.28125 | -0.1 |
| 44998.291666666664 | 3.09 |
| 44998.302083333336 | 2.57 |
| 44998.3125 | 12.34 |
| 44998.322916666664 | 13.27 |
| 44998.333333333336 | 3.77 |
| 44998.34375 | 16.03 |
| 44998.354166666664 | 518.43 |
| 44998.364583333336 | 518.35 |
| 44998.375 | 517.1 |
| 44998.385416666664 | 518.36 |
| 44998.395833333336 | 518.41 |
| 44998.40625 | 518.29 |
| 44998.416666666664 | 251.63 |
| 44998.427083333336 | 4.8 |
| 44998.4375 | 14.7 |
| 44998.447916666664 | 239.2 |
| 44998.458333333336 | 20.51 |
| 44998.46875 | 72.29 |
| 44998.479166666664 | 5.34 |
| 44998.489583333336 | 5.31 |
| 44998.5 | 82.62 |
| 44998.510416666664 | 12.3 |
| 44998.520833333336 | 59.12 |
| 44998.53125 | 7.07 |
| 44998.541666666664 | 3.77 |
| 44998.552083333336 | 3.81 |
| 44998.5625 | 4.16 |
| 44998.572916666664 | 3.96 |
| 44998.583333333336 | 2.65 |
| 44998.59375 | 3.68 |
| 44998.604166666664 | 5.84 |
| 44998.614583333336 | 10.02 |
| 44998.625 | 5.05 |
| 44998.635416666664 | 6.66 |
| 44998.645833333336 | 9.18 |
| 44998.65625 | 6.41 |
| 44998.666666666664 | 4.81 |
| 44998.677083333336 | 2.49 |
| 44998.6875 | 4.7 |
| 44998.697916666664 | 4.43 |
| 44998.708333333336 | 1.6 |
| 44998.71875 | 1.23 |
| 44998.729166666664 | 1.44 |
| 44998.739583333336 | 1.06 |
| 44998.75 | 1.41 |
| 44998.760416666664 | 1.76 |
| 44998.770833333336 | 0.12 |
| 44998.78125 | 0.46 |
| 44998.791666666664 | 0.53 |
| 44998.802083333336 | 0.25 |
| 44998.8125 | 0.27 |
| 44998.822916666664 | 0.55 |
| 44998.833333333336 | 0.93 |
| 44998.84375 | 1.75 |
| 44998.854166666664 | 0.78 |
| 44998.864583333336 | 1.98 |
| 44998.875 | 5.36 |
| 44998.885416666664 | 11.34 |
| 44998.895833333336 | 8 |
| 44998.90625 | 7.07 |
| 44998.916666666664 | 8.57 |
| 44998.927083333336 | 10.95 |
| 44998.9375 | 27.86 |
| 44998.947916666664 | 9.61 |
| 44998.958333333336 | 106.87 |
| 44998.96875 | 13.59 |
| 44998.979166666664 | 24.63 |
| 44998.989583333336 | 12.32 |
| 44999.0 | 20.39 |
| 44999.010416666664 | 5.12 |
| 44999.020833333336 | 25.29 |
| 44999.03125 | 3.08 |
| 44999.041666666664 | 34.24 |
| 44999.052083333336 | 2.88 |
| 44999.0625 | 1.55 |
| 44999.072916666664 | 135.12 |
| 44999.083333333336 | 0.55 |
| 44999.09375 | -0.23 |
| 44999.104166666664 | 0.33 |
| 44999.114583333336 | 299 |
| 44999.125 | 0.12 |
| 44999.135416666664 | -1.33 |
| 44999.145833333336 | 1.4 |
| 44999.15625 | 1.41 |
| 44999.166666666664 | 32.47 |
| 44999.177083333336 | 279.9 |
| 44999.1875 | 0.3 |
| 44999.197916666664 | 25.07 |
| 44999.208333333336 | 67.86 |
| 44999.21875 | 47.24 |
| 44999.229166666664 | 74.08 |
| 44999.239583333336 | 22.62 |
| 44999.25 | 75.22 |
| 44999.260416666664 | 9.98 |
| 44999.270833333336 | -0.45 |
| 44999.28125 | -0.33 |
| 44999.291666666664 | -1.17 |
| 44999.302083333336 | -1.34 |
| 44999.3125 | -1.77 |
| 44999.322916666664 | 0.04 |
| 44999.333333333336 | 2.07 |
| 44999.34375 | 1.69 |
| 44999.354166666664 | 4.14 |
| 44999.364583333336 | 7.09 |
| 44999.375 | 9.33 |
| 44999.385416666664 | 4.17 |
| 44999.395833333336 | 9.73 |
| 44999.40625 | 7.99 |
| 44999.416666666664 | 5.04 |
| 44999.427083333336 | 6.15 |
| 44999.4375 | 519.49 |
| 44999.447916666664 | 505.61 |
| 44999.458333333336 | 58.84 |
| 44999.46875 | 10.73 |
| 44999.479166666664 | 19.87 |
| 44999.489583333336 | 21.27 |
| 44999.5 | 26.09 |
| 44999.510416666664 | 23.77 |
| 44999.520833333336 | 13.33 |
| 44999.53125 | 466.25 |
| 44999.541666666664 | 9.09 |
| 44999.552083333336 | 6.95 |
| 44999.5625 | 4.59 |
| 44999.572916666664 | 4.54 |
| 44999.583333333336 | 3.97 |
| 44999.59375 | 3.96 |
| 44999.604166666664 | 5.54 |
| 44999.614583333336 | 2.37 |
| 44999.625 | 2.32 |
| 44999.635416666664 | 1.74 |
| 44999.645833333336 | 1.93 |
| 44999.65625 | 2.25 |
| 44999.666666666664 | 1.45 |
| 44999.677083333336 | 1.9 |
| 44999.6875 | 2.07 |
| 44999.697916666664 | 1.65 |
| 44999.708333333336 | 0.03 |
| 44999.71875 | 1.43 |
| 44999.729166666664 | 2.63 |
| 44999.739583333336 | 2.75 |
| 44999.75 | 0.38 |
| 44999.760416666664 | 0.65 |
| 44999.770833333336 | 3.33 |
| 44999.78125 | 2.54 |
| 44999.791666666664 | 2.85 |
| 44999.802083333336 | 5.46 |
| 44999.8125 | 4.46 |
| 44999.822916666664 | 7.08 |
| 44999.833333333336 | 6.43 |
| 44999.84375 | 31.29 |
| 44999.854166666664 | 18.74 |
| 44999.864583333336 | 41.76 |
| 44999.875 | 343.72 |
| 44999.885416666664 | 394.08 |
| 44999.895833333336 | 21.32 |
| 44999.90625 | 475.1 |
| 44999.916666666664 | 483.19 |
| 44999.927083333336 | 493.01 |
| 44999.9375 | 212.72 |
| 44999.947916666664 | 26.37 |
| 44999.958333333336 | 49.88 |
| 44999.96875 | 36.62 |
| 44999.979166666664 | 69.15 |
| 44999.989583333336 | 32.52 |
| 45000.0 | 30.3 |
| 45000.010416666664 | 28 |
| 45000.020833333336 | 52.47 |
| 45000.03125 | 24.61 |
| 45000.041666666664 | 15.5 |
| 45000.052083333336 | 17.14 |
| 45000.0625 | 12.99 |
| 45000.072916666664 | 10.44 |
| 45000.083333333336 | 11.15 |
| 45000.09375 | 9.83 |
| 45000.104166666664 | 7.36 |
| 45000.114583333336 | 6.91 |
| 45000.125 | 8 |
| 45000.135416666664 | 10.63 |
| 45000.145833333336 | 8.32 |
| 45000.15625 | 7.21 |
| 45000.166666666664 | 6.02 |
| 45000.177083333336 | 8.02 |
| 45000.1875 | 7.15 |
| 45000.197916666664 | 6.28 |
| 45000.208333333336 | 7.06 |
| 45000.21875 | 8.33 |
| 45000.229166666664 | 20.51 |
| 45000.239583333336 | 22.26 |
| 45000.25 | 25.36 |
| 45000.260416666664 | 89.39 |
| 45000.270833333336 | 63.34 |
| 45000.28125 | 10.92 |
| 45000.291666666664 | 17.93 |
| 45000.302083333336 | 10.85 |
| 45000.3125 | 8.78 |
| 45000.322916666664 | 12.4 |
| 45000.333333333336 | 18.29 |
| 45000.34375 | 26.07 |
| 45000.354166666664 | 17.01 |
| 45000.364583333336 | 6.21 |
| 45000.375 | 17.87 |
| 45000.385416666664 | 11.15 |
| 45000.395833333336 | 103.43 |
| 45000.40625 | 32.37 |
| 45000.416666666664 | 13.57 |
| 45000.427083333336 | 208.19 |
| 45000.4375 | 162.55 |
| 45000.447916666664 | 307 |
| 45000.458333333336 | 160.46 |
| 45000.46875 | 471.37 |
| 45000.479166666664 | 503.53 |
| 45000.489583333336 | 44.04 |
| 45000.5 | 32.4 |
| 45000.510416666664 | 100.73 |
| 45000.520833333336 | 277.87 |
| 45000.53125 | 144.58 |
| 45000.541666666664 | 118.21 |
| 45000.552083333336 | 14.15 |
| 45000.5625 | 11.36 |
| 45000.572916666664 | 10.94 |
| 45000.583333333336 | 13.44 |
| 45000.59375 | 12.44 |
| 45000.604166666664 | 16.84 |
| 45000.614583333336 | 7.06 |
| 45000.625 | 19.9 |
| 45000.635416666664 | 6.13 |
| 45000.645833333336 | 7.23 |
| 45000.65625 | 13.64 |
| 45000.666666666664 | 11.14 |
| 45000.677083333336 | 12.01 |
| 45000.6875 | 4.41 |
| 45000.697916666664 | 11.99 |
| 45000.708333333336 | 33.05 |
| 45000.71875 | 10.46 |
| 45000.729166666664 | 9.76 |
| 45000.739583333336 | 6.58 |
| 45000.75 | 8.35 |
| 45000.760416666664 | 8.86 |
| 45000.770833333336 | 11.25 |
| 45000.78125 | 10.99 |
| 45000.791666666664 | 11.29 |
| 45000.802083333336 | 9.44 |
| 45000.8125 | 50.52 |
| 45000.822916666664 | 6.97 |
| 45000.833333333336 | 7.04 |
| 45000.84375 | 6.57 |
| 45000.854166666664 | 8.63 |
| 45000.864583333336 | 11.58 |
| 45000.875 | 9.66 |
| 45000.885416666664 | 10.98 |
| 45000.895833333336 | 10.48 |
| 45000.90625 | 12.54 |
| 45000.916666666664 | 10.38 |
| 45000.927083333336 | 11.53 |
| 45000.9375 | 9.86 |
| 45000.947916666664 | 13.53 |
| 45000.958333333336 | 11.02 |
| 45000.96875 | 11.67 |
| 45000.979166666664 | 12.17 |
| 45000.989583333336 | 10.6 |
| 45001.0 | 9.16 |
| 45001.010416666664 | 9.75 |
| 45001.020833333336 | 9.76 |
| 45001.03125 | 12.91 |
| 45001.041666666664 | 8.85 |
| 45001.052083333336 | 9.88 |
| 45001.0625 | 10.43 |
| 45001.072916666664 | 8.47 |
| 45001.083333333336 | 6.53 |
| 45001.09375 | 6.54 |
| 45001.104166666664 | 7.69 |
| 45001.114583333336 | 7.53 |
| 45001.125 | 6.1 |
| 45001.135416666664 | 7.17 |
| 45001.145833333336 | 6.13 |
| 45001.15625 | 8.14 |
| 45001.166666666664 | 8.14 |
| 45001.177083333336 | 15.12 |
| 45001.1875 | 36.89 |
| 45001.197916666664 | 5.97 |
| 45001.208333333336 | 10.38 |
| 45001.21875 | 13.64 |
| 45001.229166666664 | 13.18 |
| 45001.239583333336 | 6.62 |
| 45001.25 | 514.68 |
| 45001.260416666664 | 7.89 |
| 45001.270833333336 | 7.69 |
| 45001.28125 | 55.46 |
| 45001.291666666664 | 9.11 |
| 45001.302083333336 | 9.49 |
| 45001.3125 | 14.2 |
| 45001.322916666664 | 14.04 |
| 45001.333333333336 | 19.04 |
| 45001.34375 | 12.74 |
| 45001.354166666664 | 8.26 |
| 45001.364583333336 | 7.21 |
| 45001.375 | 5.5 |
| 45001.385416666664 | 4.84 |
| 45001.395833333336 | 4.53 |
| 45001.40625 | 6.05 |
| 45001.416666666664 | 6.84 |
| 45001.427083333336 | 6.19 |
| 45001.4375 | 4.92 |
| 45001.447916666664 | 4.33 |
| 45001.458333333336 | 5.15 |
| 45001.46875 | 4.87 |
| 45001.479166666664 | 4.88 |
| 45001.489583333336 | 5.81 |
| 45001.5 | 6.79 |
| 45001.510416666664 | 6.92 |
| 45001.520833333336 | 12.23 |
| 45001.53125 | 20.52 |
| 45001.541666666664 | 5.59 |
| 45001.552083333336 | 6.45 |
| 45001.5625 | 7.39 |
| 45001.572916666664 | 10.46 |
| 45001.583333333336 | 5.53 |
| 45001.59375 | 28.74 |
| 45001.604166666664 | 5.53 |
| 45001.614583333336 | 2.91 |
| 45001.625 | 2.59 |
| 45001.635416666664 | 3.21 |
| 45001.645833333336 | 2.85 |
| 45001.65625 | 4.96 |
| 45001.666666666664 | 5.74 |
| 45001.677083333336 | 2.92 |
| 45001.6875 | 3.01 |
| 45001.697916666664 | 6.76 |
| 45001.708333333336 | 147.9 |
| 45001.71875 | 4.47 |
| 45001.729166666664 | 3.43 |
| 45001.739583333336 | 3.79 |
| 45001.75 | 3.18 |
| 45001.760416666664 | 3.15 |
| 45001.770833333336 | 3.17 |
| 45001.78125 | 4.39 |
| 45001.791666666664 | 3.55 |
| 45001.802083333336 | 3.89 |
| 45001.8125 | 1.86 |
| 45001.822916666664 | 2.08 |
| 45001.833333333336 | 3.59 |
| 45001.84375 | 2.11 |
| 45001.854166666664 | 2.45 |
| 45001.864583333336 | 2.82 |
| 45001.875 | 3.04 |
| 45001.885416666664 | 3.03 |
| 45001.895833333336 | 2.45 |
| 45001.90625 | 3.66 |
| 45001.916666666664 | 4.12 |
| 45001.927083333336 | 3.51 |
| 45001.9375 | 4.15 |
| 45001.947916666664 | 3.29 |
| 45001.958333333336 | 3.68 |
| 45001.96875 | 2.82 |
| 45001.979166666664 | 5.48 |
| 45001.989583333336 | 5.76 |
| 45002.0 | 446.97 |
| 45002.010416666664 | 4.43 |
| 45002.020833333336 | 505.32 |
| 45002.03125 | 352.94 |
| 45002.041666666664 | 8.16 |
| 45002.052083333336 | 107.01 |
| 45002.0625 | 430.33 |
| 45002.072916666664 | 360.15 |
| 45002.083333333336 | 18.35 |
| 45002.09375 | 17.11 |
| 45002.104166666664 | 9.09 |
| 45002.114583333336 | 10.94 |
| 45002.125 | 6.74 |
| 45002.135416666664 | 7.78 |
| 45002.145833333336 | 5.87 |
| 45002.15625 | 5.23 |
| 45002.166666666664 | 4.94 |
| 45002.177083333336 | 4.77 |
| 45002.1875 | 4.64 |
| 45002.197916666664 | 3.71 |
| 45002.208333333336 | 3.99 |
| 45002.21875 | 3.96 |
| 45002.229166666664 | 2.19 |
| 45002.239583333336 | 3.59 |
| 45002.25 | 5.45 |
| 45002.260416666664 | 3.78 |
| 45002.270833333336 | 21.32 |
| 45002.28125 | 12.75 |
| 45002.291666666664 | 2.5 |
| 45002.302083333336 | 43.47 |
| 45002.3125 | 22.71 |
| 45002.322916666664 | 18.35 |
| 45002.333333333336 | 7.73 |
| 45002.34375 | 15.95 |
| 45002.354166666664 | 6.35 |
| 45002.364583333336 | 11.62 |
| 45002.375 | 10.98 |
| 45002.385416666664 | 16.07 |
| 45002.395833333336 | 5.39 |
| 45002.40625 | 3 |
| 45002.416666666664 | 5.23 |
| 45002.427083333336 | 6.1 |
| 45002.4375 | 15.09 |
| 45002.447916666664 | 12.01 |
| 45002.458333333336 | 42.3 |
| 45002.46875 | 53.06 |
| 45002.479166666664 | 26.97 |
| 45002.489583333336 | 512.44 |
| 45002.5 | 33.17 |
| 45002.510416666664 | 43.45 |
| 45002.520833333336 | 69.72 |
| 45002.53125 | 35.65 |
| 45002.541666666664 | 33.13 |
| 45002.552083333336 | 55.4 |
| 45002.5625 | 43.77 |
| 45002.572916666664 | 72.6 |
| 45002.583333333336 | 27.12 |
| 45002.59375 | 18.48 |
| 45002.604166666664 | 41.59 |
| 45002.614583333336 | 60.37 |
| 45002.625 | 23.68 |
| 45002.635416666664 | 13.84 |
| 45002.645833333336 | 6.53 |
| 45002.65625 | 18.53 |
| 45002.666666666664 | 5.37 |
| 45002.677083333336 | 4.52 |
| 45002.6875 | 5.41 |
| 45002.697916666664 | 5.37 |
| 45002.708333333336 | 4.99 |
| 45002.71875 | 4.87 |
| 45002.729166666664 | 4.51 |
| 45002.739583333336 | 4.48 |
| 45002.75 | 4.65 |
| 45002.760416666664 | 4.27 |
| 45002.770833333336 | 4.36 |
| 45002.78125 | 4.64 |
| 45002.791666666664 | 3.73 |
| 45002.802083333336 | 3.9 |
| 45002.8125 | 5.66 |
| 45002.822916666664 | 8.41 |
| 45002.833333333336 | 7.45 |
| 45002.84375 | 8.14 |
| 45002.854166666664 | 8.7 |
| 45002.864583333336 | 10.12 |
| 45002.875 | 6.62 |
| 45002.885416666664 | 7.59 |
| 45002.895833333336 | 7.41 |
| 45002.90625 | 3.24 |
| 45002.916666666664 | 4.03 |
| 45002.927083333336 | 4.61 |
| 45002.9375 | 3.4 |
| 45002.947916666664 | 3.99 |
| 45002.958333333336 | 6.15 |
| 45002.96875 | 6.54 |
| 45002.979166666664 | 8.56 |
| 45002.989583333336 | 54.01 |
| 45003.0 | 9.12 |
| 45003.010416666664 | 7.17 |
| 45003.020833333336 | 13.24 |
| 45003.03125 | 109.99 |
| 45003.041666666664 | 111.22 |
| 45003.052083333336 | 328.03 |
| 45003.0625 | 286.87 |
| 45003.072916666664 | 313.88 |
| 45003.083333333336 | 64 |
| 45003.09375 | 446.26 |
| 45003.104166666664 | 415.21 |
| 45003.114583333336 | 376.36 |
| 45003.125 | 31.42 |
| 45003.135416666664 | 53.81 |
| 45003.145833333336 | 18.9 |
| 45003.15625 | 8 |
| 45003.166666666664 | 6.07 |
| 45003.177083333336 | 11.12 |
| 45003.1875 | 9.61 |
| 45003.197916666664 | 9.15 |
| 45003.208333333336 | 7.73 |
| 45003.21875 | 7.15 |
| 45003.229166666664 | 6.31 |
| 45003.239583333336 | 5.34 |
| 45003.25 | 4.53 |
| 45003.260416666664 | 4.81 |
| 45003.270833333336 | 7.07 |
| 45003.28125 | 4.39 |
| 45003.291666666664 | 3.6 |
| 45003.302083333336 | 6.43 |
| 45003.3125 | 12.82 |
| 45003.322916666664 | 23.13 |
| 45003.333333333336 | 6.92 |
| 45003.34375 | 6.2 |
| 45003.354166666664 | 35.4 |
| 45003.364583333336 | 29.12 |
| 45003.375 | 20.42 |
| 45003.385416666664 | 6.34 |
| 45003.395833333336 | 32.19 |
| 45003.40625 | 36.37 |
| 45003.416666666664 | 15.28 |
| 45003.427083333336 | 35.71 |
| 45003.4375 | 17.94 |
| 45003.447916666664 | 6.29 |
| 45003.458333333336 | 8.19 |
| 45003.46875 | 2.89 |
| 45003.479166666664 | 5.37 |
| 45003.489583333336 | 5.59 |
| 45003.5 | 5.95 |
| 45003.510416666664 | 6.1 |
| 45003.520833333336 | 6.86 |
| 45003.53125 | 514.61 |
| 45003.541666666664 | 8.63 |
| 45003.552083333336 | 11.91 |
| 45003.5625 | 9.41 |
| 45003.572916666664 | 13.21 |
| 45003.583333333336 | 10.4 |
| 45003.59375 | 10.37 |
| 45003.604166666664 | 12.29 |
| 45003.614583333336 | 9.83 |
| 45003.625 | 10.52 |
| 45003.635416666664 | 10.36 |
| 45003.645833333336 | 10.29 |
| 45003.65625 | 12.33 |
| 45003.666666666664 | 10.88 |
| 45003.677083333336 | 37.36 |
| 45003.6875 | 11.97 |
| 45003.697916666664 | 14.24 |
| 45003.708333333336 | 9.7 |
| 45003.71875 | 7.96 |
| 45003.729166666664 | 9.64 |
| 45003.739583333336 | 5.22 |
| 45003.75 | 10.48 |
| 45003.760416666664 | 6.15 |
| 45003.770833333336 | 4.15 |
| 45003.78125 | 430.15 |
| 45003.791666666664 | 4.95 |
| 45003.802083333336 | 3.04 |
| 45003.8125 | 3.55 |
| 45003.822916666664 | 3.19 |
| 45003.833333333336 | 15.6 |
| 45003.84375 | 27.5 |
| 45003.854166666664 | 2.9 |
| 45003.864583333336 | 2.28 |
| 45003.875 | 2.37 |
| 45003.885416666664 | 2.76 |
| 45003.895833333336 | 1.47 |
| 45003.90625 | 2.53 |
| 45003.916666666664 | 2.13 |
| 45003.927083333336 | 0.88 |
| 45003.9375 | 1.32 |
| 45003.947916666664 | 1.69 |
| 45003.958333333336 | 0.91 |
| 45003.96875 | 0.96 |
| 45003.979166666664 | 0.67 |
| 45003.989583333336 | 0.68 |
| 45004.0 | 0.64 |
| 45004.010416666664 | -0.03 |
| 45004.020833333336 | 0.31 |
| 45004.03125 | 2 |
| 45004.041666666664 | 6.69 |
| 45004.052083333336 | 12.94 |
| 45004.0625 | 49.25 |
| 45004.072916666664 | 7.67 |
| 45004.083333333336 | 12.46 |
| 45004.09375 | 250.38 |
| 45004.104166666664 | 116.69 |
| 45004.114583333336 | 416.85 |
| 45004.125 | 56.45 |
| 45004.135416666664 | 5.46 |
| 45004.145833333336 | 5.14 |
| 45004.15625 | 7.8 |
| 45004.166666666664 | 8.49 |
| 45004.177083333336 | 8.69 |
| 45004.1875 | 17.67 |
| 45004.197916666664 | 38.32 |
| 45004.208333333336 | 39.27 |
| 45004.21875 | 30.41 |
| 45004.229166666664 | 5.81 |
| 45004.239583333336 | 5.41 |
| 45004.25 | 4.92 |
| 45004.260416666664 | 4.22 |
| 45004.270833333336 | 3.47 |
| 45004.28125 | 3.52 |
| 45004.291666666664 | 2.29 |
| 45004.302083333336 | 1.68 |
| 45004.3125 | 0.24 |
| 45004.322916666664 | 0.13 |
| 45004.333333333336 | 1.15 |
| 45004.34375 | 3.64 |
| 45004.354166666664 | 4.17 |
| 45004.364583333336 | 2.24 |
| 45004.375 | 2.92 |
| 45004.385416666664 | 2.87 |
| 45004.395833333336 | 2.82 |
| 45004.40625 | 7.8 |
| 45004.416666666664 | 3.07 |
| 45004.427083333336 | 4.11 |
| 45004.4375 | 3.72 |
| 45004.447916666664 | 4.23 |
| 45004.458333333336 | 4.17 |
| 45004.46875 | 3.5 |
| 45004.479166666664 | 3.63 |
| 45004.489583333336 | 2.51 |
| 45004.5 | 3.29 |
| 45004.510416666664 | 3.58 |
| 45004.520833333336 | 3.46 |
| 45004.53125 | 4.31 |
| 45004.541666666664 | 2.99 |
| 45004.552083333336 | 4.8 |
| 45004.5625 | 4.79 |
| 45004.572916666664 | 5.84 |
| 45004.583333333336 | 7.47 |
| 45004.59375 | 9.17 |
| 45004.604166666664 | 9.68 |
| 45004.614583333336 | 8.8 |
| 45004.625 | 8.46 |
| 45004.635416666664 | 21.27 |
| 45004.645833333336 | 36.83 |
| 45004.65625 | 31.6 |
| 45004.666666666664 | 52.84 |
| 45004.677083333336 | 161.83 |
| 45004.6875 | 296.9 |
| 45004.697916666664 | 80.6 |
| 45004.708333333336 | 106.94 |
| 45004.71875 | 89.83 |
| 45004.729166666664 | 11.53 |
| 45004.739583333336 | 13.53 |
| 45004.75 | 8.64 |
| 45004.760416666664 | 5.28 |
| 45004.770833333336 | 5.68 |
| 45004.78125 | 5.43 |
| 45004.791666666664 | 6.19 |
| 45004.802083333336 | 4.99 |
| 45004.8125 | 4.3 |
| 45004.822916666664 | 4.18 |
| 45004.833333333336 | 4.67 |
| 45004.84375 | 4.16 |
| 45004.854166666664 | 3.23 |
| 45004.864583333336 | 3.27 |
| 45004.875 | 3.18 |
| 45004.885416666664 | 3.07 |
| 45004.895833333336 | 3.77 |
| 45004.90625 | 14.13 |
| 45004.916666666664 | 12.77 |
| 45004.927083333336 | 19.75 |
| 45004.9375 | 42.07 |
| 45004.947916666664 | 14.74 |
| 45004.958333333336 | 51.29 |
| 45004.96875 | 45.02 |
| 45004.979166666664 | 5.35 |
| 45004.989583333336 | 31.59 |
| 45005.0 | 2.85 |
| 45005.010416666664 | 1.68 |
| 45005.020833333336 | 2.09 |
| 45005.03125 | 1.86 |
| 45005.041666666664 | 1.76 |
| 45005.052083333336 | 1.41 |
| 45005.0625 | 1.31 |
| 45005.072916666664 | 2.35 |
| 45005.083333333336 | 3.78 |
| 45005.09375 | 2.77 |
| 45005.104166666664 | 2.67 |
| 45005.114583333336 | 4.27 |
| 45005.125 | 5.35 |
| 45005.135416666664 | 5.54 |
| 45005.145833333336 | 6.17 |
| 45005.15625 | 7.09 |
| 45005.166666666664 | 7.52 |
| 45005.177083333336 | 7.89 |
| 45005.1875 | 8.21 |
| 45005.197916666664 | 7.37 |
| 45005.208333333336 | 8.79 |
| 45005.21875 | 7.68 |
| 45005.229166666664 | 8.44 |
| 45005.239583333336 | 9.36 |
| 45005.25 | 7.62 |
| 45005.260416666664 | 5.33 |
| 45005.270833333336 | 5.68 |
| 45005.28125 | 163.17 |
| 45005.291666666664 | 33.21 |
| 45005.302083333336 | 6.02 |
| 45005.3125 | 6.74 |
| 45005.322916666664 | 3.89 |
| 45005.333333333336 | 5 |
| 45005.34375 | 29.17 |
| 45005.354166666664 | 3.09 |
| 45005.364583333336 | 3.15 |
| 45005.375 | 21.72 |
| 45005.385416666664 | 14.56 |
| 45005.395833333336 | 4.43 |
| 45005.40625 | 8.58 |
| 45005.416666666664 | 5.77 |
| 45005.427083333336 | 10.4 |
| 45005.4375 | 24.73 |
| 45005.447916666664 | 5.5 |
| 45005.458333333336 | 6.13 |
| 45005.46875 | 18.42 |
| 45005.479166666664 | 23.97 |
| 45005.489583333336 | 100.52 |
| 45005.5 | 85.97 |
| 45005.510416666664 | 11.59 |
| 45005.520833333336 | 2.75 |
| 45005.53125 | 2.57 |
| 45005.541666666664 | 2.43 |
| 45005.552083333336 | 3.57 |
| 45005.5625 | 3.7 |
| 45005.572916666664 | 6.71 |
| 45005.583333333336 | 7 |
| 45005.59375 | 6.75 |
| 45005.604166666664 | 8.87 |
| 45005.614583333336 | 7.16 |
| 45005.625 | 12.58 |
| 45005.635416666664 | 8.92 |
| 45005.645833333336 | 8.54 |
| 45005.65625 | 6.3 |
| 45005.666666666664 | 9.26 |
| 45005.677083333336 | 12.44 |
| 45005.6875 | 13.48 |
| 45005.697916666664 | 9.71 |
| 45005.708333333336 | 11.43 |
| 45005.71875 | 13.65 |
| 45005.729166666664 | 12.23 |
| 45005.739583333336 | 10.27 |
| 45005.75 | 6.22 |
| 45005.760416666664 | 8.44 |
| 45005.770833333336 | 7.82 |
| 45005.78125 | 7.43 |
| 45005.791666666664 | 3.48 |
| 45005.802083333336 | 4.39 |
| 45005.8125 | 4.75 |
| 45005.822916666664 | 6.43 |
| 45005.833333333336 | 30.43 |
| 45005.84375 | 3.8 |
| 45005.854166666664 | 22.26 |
| 45005.864583333336 | 403.93 |
| 45005.875 | 8.78 |
| 45005.885416666664 | 3.18 |
| 45005.895833333336 | 5.38 |
| 45005.90625 | 2.77 |
| 45005.916666666664 | 4.44 |
| 45005.927083333336 | 3.33 |
| 45005.9375 | 2.85 |
| 45005.947916666664 | 5.35 |
| 45005.958333333336 | 5.36 |
| 45005.96875 | 4.56 |
| 45005.979166666664 | 4.7 |
| 45005.989583333336 | 23.45 |
| 45006.0 | 17.57 |
| 45006.010416666664 | 6.08 |
| 45006.020833333336 | 6.57 |
| 45006.03125 | 5.41 |
| 45006.041666666664 | 2.46 |
| 45006.052083333336 | 2.25 |
| 45006.0625 | 2.19 |
| 45006.072916666664 | 2.17 |
| 45006.083333333336 | 2.01 |
| 45006.09375 | 2.3 |
| 45006.104166666664 | 2.39 |
| 45006.114583333336 | 3.58 |
| 45006.125 | 4.31 |
| 45006.135416666664 | 4.9 |
| 45006.145833333336 | 5.8 |
| 45006.15625 | 6.83 |
| 45006.166666666664 | 7.86 |
| 45006.177083333336 | 32.04 |
| 45006.1875 | 8.14 |
| 45006.197916666664 | 27.33 |
| 45006.208333333336 | 23.4 |
| 45006.21875 | 7.8 |
| 45006.229166666664 | 7.45 |
| 45006.239583333336 | 8.46 |
| 45006.25 | 20.23 |
| 45006.260416666664 | 9.5 |
| 45006.270833333336 | 8.99 |
| 45006.28125 | 15.42 |
| 45006.291666666664 | 8.14 |
| 45006.302083333336 | 6.24 |
| 45006.3125 | 6.86 |
| 45006.322916666664 | 10.97 |
| 45006.333333333336 | 7.03 |
| 45006.34375 | 5.56 |
| 45006.354166666664 | 7.42 |
| 45006.364583333336 | 7.28 |
| 45006.375 | 13.92 |
| 45006.385416666664 | 5.99 |
| 45006.395833333336 | 3.74 |
| 45006.40625 | 3.13 |
| 45006.416666666664 | 3.8 |
| 45006.427083333336 | 2.09 |
| 45006.4375 | 7.02 |
| 45006.447916666664 | 3.97 |
| 45006.458333333336 | 3.25 |
| 45006.46875 | 58.14 |
| 45006.479166666664 | 4.56 |
| 45006.489583333336 | 70.34 |
| 45006.5 | 362.23 |
| 45006.510416666664 | 402.29 |
| 45006.520833333336 | 57.28 |
| 45006.53125 | 388.96 |
| 45006.541666666664 | 465.61 |
| 45006.552083333336 | 233.39 |
| 45006.5625 | 2.25 |
| 45006.572916666664 | 0.06 |
| 45006.583333333336 | 0.05 |
| 45006.59375 | 0.7 |
| 45006.604166666664 | 0.37 |
| 45006.614583333336 | 0.09 |
| 45006.625 | 0.71 |
| 45006.635416666664 | -1.04 |
| 45006.645833333336 | 489.08 |
| 45006.65625 | 510.7 |
| 45006.666666666664 | 4.03 |
| 45006.677083333336 | 6.34 |
| 45006.6875 | 5.02 |
| 45006.697916666664 | 13.78 |
| 45006.708333333336 | 401.43 |
| 45006.71875 | 288.6 |
| 45006.729166666664 | 518.74 |
| 45006.739583333336 | 518.54 |
| 45006.75 | 470.61 |
| 45006.760416666664 | 323.19 |
| 45006.770833333336 | 16.39 |
| 45006.78125 | 514.27 |
| 45006.791666666664 | 62.4 |
| 45006.802083333336 | 27.65 |
| 45006.8125 | 16.79 |
| 45006.822916666664 | 4.49 |
| 45006.833333333336 | 4.31 |
| 45006.84375 | 5.02 |
| 45006.854166666664 | 5.74 |
| 45006.864583333336 | 3.97 |
| 45006.875 | 3.7 |
| 45006.885416666664 | 3.23 |
| 45006.895833333336 | 2.71 |
| 45006.90625 | 2.62 |
| 45006.916666666664 | 2.6 |
| 45006.927083333336 | 2.86 |
| 45006.9375 | 2.5 |
| 45006.947916666664 | 3.26 |
| 45006.958333333336 | 2.07 |
| 45006.96875 | 2.13 |
| 45006.979166666664 | 2.32 |
| 45006.989583333336 | 2.88 |
| 45007.0 | 3.01 |
| 45007.010416666664 | 3.01 |
| 45007.020833333336 | 3.53 |
| 45007.03125 | 3.11 |
| 45007.041666666664 | 2.79 |
| 45007.052083333336 | 3.39 |
| 45007.0625 | 4.47 |
| 45007.072916666664 | 3.84 |
| 45007.083333333336 | 6.5 |
| 45007.09375 | 8.13 |
| 45007.104166666664 | 43.01 |
| 45007.114583333336 | 37.72 |
| 45007.125 | 6.36 |
| 45007.135416666664 | 5.89 |
| 45007.145833333336 | 9.97 |
| 45007.15625 | 12.65 |
| 45007.166666666664 | 7.14 |
| 45007.177083333336 | 6.03 |
| 45007.1875 | 5.1 |
| 45007.197916666664 | 3.76 |
| 45007.208333333336 | 4.89 |
| 45007.21875 | 9.23 |
| 45007.229166666664 | 3.09 |
| 45007.239583333336 | 21.77 |
| 45007.25 | 7.5 |
| 45007.260416666664 | 8.78 |
| 45007.270833333336 | 10.3 |
| 45007.28125 | 7.34 |
| 45007.291666666664 | 6.94 |
| 45007.302083333336 | 12.63 |
| 45007.3125 | 6.4 |
| 45007.322916666664 | 257.21 |
| 45007.333333333336 | 247.2 |
| 45007.34375 | 4.23 |
| 45007.354166666664 | 3.64 |
| 45007.364583333336 | 3.76 |
| 45007.375 | 3.82 |
| 45007.385416666664 | 3.28 |
| 45007.395833333336 | 2.27 |
| 45007.40625 | 1.93 |
| 45007.416666666664 | 1.5 |
| 45007.427083333336 | 2.09 |
| 45007.4375 | 2.59 |
| 45007.447916666664 | 2.73 |
| 45007.458333333336 | 2.39 |
| 45007.46875 | 2.96 |
| 45007.479166666664 | 3.37 |
| 45007.489583333336 | 223.57 |
| 45007.5 | 2.98 |
| 45007.510416666664 | 3.16 |
| 45007.520833333336 | 8.89 |
| 45007.53125 | 8.78 |
| 45007.541666666664 | 4.02 |
| 45007.552083333336 | 5.1 |
| 45007.5625 | 3.28 |
| 45007.572916666664 | 2.13 |
| 45007.583333333336 | 3.26 |
| 45007.59375 | 2.56 |
| 45007.604166666664 | 14.33 |
| 45007.614583333336 | 33.66 |
| 45007.625 | 196.07 |
| 45007.635416666664 | 508.84 |
| 45007.645833333336 | 207.65 |
| 45007.65625 | 279.6 |
| 45007.666666666664 | 128.79 |
| 45007.677083333336 | 137.03 |
| 45007.6875 | 31.31 |
| 45007.697916666664 | 20.07 |
| 45007.708333333336 | 78.8 |
| 45007.71875 | 41.32 |
| 45007.729166666664 | 39.86 |
| 45007.739583333336 | 9.89 |
| 45007.75 | 27.23 |
| 45007.760416666664 | 16.13 |
| 45007.770833333336 | 18.58 |
| 45007.78125 | 15.9 |
| 45007.791666666664 | 21.89 |
| 45007.802083333336 | 147.84 |
| 45007.8125 | 19.1 |
| 45007.822916666664 | 53.37 |
| 45007.833333333336 | 10.66 |
| 45007.84375 | 9.64 |
| 45007.854166666664 | 6.15 |
| 45007.864583333336 | 7.6 |
| 45007.875 | 8.18 |
| 45007.885416666664 | 6.23 |
| 45007.895833333336 | 5.13 |
| 45007.90625 | 4.61 |
| 45007.916666666664 | 5.15 |
| 45007.927083333336 | 4.3 |
| 45007.9375 | 3.53 |
| 45007.947916666664 | 3.09 |
| 45007.958333333336 | 3.8 |
| 45007.96875 | 9.86 |
| 45007.979166666664 | 2.85 |
| 45007.989583333336 | 3 |
| 45008.0 | 2.54 |
| 45008.010416666664 | 2.93 |
| 45008.020833333336 | 3.38 |
| 45008.03125 | 3.19 |
| 45008.041666666664 | 3.62 |
| 45008.052083333336 | 3.49 |
| 45008.0625 | 4.26 |
| 45008.072916666664 | 3.51 |
| 45008.083333333336 | 3.45 |
| 45008.09375 | 4.1 |
| 45008.104166666664 | 3.24 |
| 45008.114583333336 | 3.42 |
| 45008.125 | 3.07 |
| 45008.135416666664 | 6.8 |
| 45008.145833333336 | 4.58 |
| 45008.15625 | 5.36 |
| 45008.166666666664 | 4.38 |
| 45008.177083333336 | 5.13 |
| 45008.1875 | 6.68 |
| 45008.197916666664 | 6.93 |
| 45008.208333333336 | 7.37 |
| 45008.21875 | 7.52 |
| 45008.229166666664 | 7.26 |
| 45008.239583333336 | 6.21 |
| 45008.25 | 7.27 |
| 45008.260416666664 | 6.4 |
| 45008.270833333336 | 6 |
| 45008.28125 | 3.94 |
| 45008.291666666664 | 5.69 |
| 45008.302083333336 | 4.39 |
| 45008.3125 | 5.5 |
| 45008.322916666664 | 5.96 |
| 45008.333333333336 | 5.8 |
| 45008.34375 | 6.86 |
| 45008.354166666664 | 7.62 |
| 45008.364583333336 | 8.51 |
| 45008.375 | 5.98 |
| 45008.385416666664 | 6.09 |
| 45008.395833333336 | 5.89 |
| 45008.40625 | 165.84 |
| 45008.416666666664 | 134.82 |
| 45008.427083333336 | 7.46 |
| 45008.4375 | 15.19 |
| 45008.447916666664 | 3.33 |
| 45008.458333333336 | 65.76 |
| 45008.46875 | 2.92 |
| 45008.479166666664 | 57.36 |
| 45008.489583333336 | 3.73 |
| 45008.5 | 6.83 |
| 45008.510416666664 | 6.43 |
| 45008.520833333336 | 1.26 |
| 45008.53125 | 2.86 |
| 45008.541666666664 | 3.64 |
| 45008.552083333336 | 46.06 |
| 45008.5625 | 17.23 |
| 45008.572916666664 | 6.1 |
| 45008.583333333336 | 22.3 |
| 45008.59375 | 22.05 |
| 45008.604166666664 | 10.06 |
| 45008.614583333336 | 2.31 |
| 45008.625 | 0.82 |
| 45008.635416666664 | 0.77 |
| 45008.645833333336 | -0.06 |
| 45008.65625 | 2.99 |
| 45008.666666666664 | 2.58 |
| 45008.677083333336 | 1.51 |
| 45008.6875 | 2.79 |
| 45008.697916666664 | 2.79 |
| 45008.708333333336 | 3.71 |
| 45008.71875 | 2.96 |
| 45008.729166666664 | 3.38 |
| 45008.739583333336 | 4.14 |
| 45008.75 | 4.57 |
| 45008.760416666664 | 3.43 |
| 45008.770833333336 | 2.73 |
| 45008.78125 | 3.14 |
| 45008.791666666664 | 4.76 |
| 45008.802083333336 | 7.72 |
| 45008.8125 | 5.03 |
| 45008.822916666664 | 7.45 |
| 45008.833333333336 | 6.56 |
| 45008.84375 | 7.58 |
| 45008.854166666664 | 13.79 |
| 45008.864583333336 | 9.54 |
| 45008.875 | 8.37 |
| 45008.885416666664 | 7.64 |
| 45008.895833333336 | 5.52 |
| 45008.90625 | 4.42 |
| 45008.916666666664 | 3.77 |
| 45008.927083333336 | 4.62 |
| 45008.9375 | 4 |
| 45008.947916666664 | 4.65 |
| 45008.958333333336 | 3.45 |
| 45008.96875 | 2.89 |
| 45008.979166666664 | 2.78 |
| 45008.989583333336 | 3.26 |
| 45009.0 | 3.13 |
| 45009.010416666664 | 3.68 |
| 45009.020833333336 | 3.67 |
| 45009.03125 | 3.22 |
| 45009.041666666664 | 2.9 |
| 45009.052083333336 | 3.66 |
| 45009.0625 | 3.23 |
| 45009.072916666664 | 2.83 |
| 45009.083333333336 | 5.5 |
| 45009.09375 | 4.67 |
| 45009.104166666664 | 3.37 |
| 45009.114583333336 | 3.24 |
| 45009.125 | 2.86 |
| 45009.135416666664 | 2.51 |
| 45009.145833333336 | 2.27 |
| 45009.15625 | 2.18 |
| 45009.166666666664 | 1.76 |
| 45009.177083333336 | 1.95 |
| 45009.1875 | 7.47 |
| 45009.197916666664 | 1.94 |
| 45009.208333333336 | 1.2 |
| 45009.21875 | 1.3 |
| 45009.229166666664 | 4.32 |
| 45009.239583333336 | 6.81 |
| 45009.25 | 7.51 |
| 45009.260416666664 | 248.37 |
| 45009.270833333336 | 432.6 |
| 45009.28125 | 502.9 |
| 45009.291666666664 | 106.91 |
| 45009.302083333336 | 56.3 |
| 45009.3125 | 28.59 |
| 45009.322916666664 | 16.91 |
| 45009.333333333336 | 11.61 |
| 45009.34375 | 51.44 |
| 45009.354166666664 | 7.52 |
| 45009.364583333336 | 19.1 |
| 45009.375 | 8.06 |
| 45009.385416666664 | 11.09 |
| 45009.395833333336 | 6.06 |
| 45009.40625 | 5.17 |
| 45009.416666666664 | 5.26 |
| 45009.427083333336 | 6.93 |
| 45009.4375 | 5.35 |
| 45009.447916666664 | 4.56 |
| 45009.458333333336 | 3.97 |
| 45009.46875 | 3.82 |
| 45009.479166666664 | 3.51 |
| 45009.489583333336 | 3.3 |
| 45009.5 | 3.37 |
| 45009.510416666664 | 3.05 |
| 45009.520833333336 | 3.03 |
| 45009.53125 | 3.13 |
| 45009.541666666664 | 2.89 |
| 45009.552083333336 | 2.03 |
| 45009.5625 | 2.62 |
| 45009.572916666664 | 2.57 |
| 45009.583333333336 | 2.39 |
| 45009.59375 | 2.5 |
| 45009.604166666664 | 1.9 |
| 45009.614583333336 | 1.7 |
| 45009.625 | 1.9 |
| 45009.635416666664 | 1.93 |
| 45009.645833333336 | 1.39 |
| 45009.65625 | 2.71 |
| 45009.666666666664 | 0.81 |
| 45009.677083333336 | 1.33 |
| 45009.6875 | -0.06 |
| 45009.697916666664 | 2.97 |
| 45009.708333333336 | 3.03 |
| 45009.71875 | 2.72 |
| 45009.729166666664 | 3.92 |
| 45009.739583333336 | 3.4 |
| 45009.75 | 3.46 |
| 45009.760416666664 | 3.65 |
| 45009.770833333336 | 3.15 |
| 45009.78125 | 5.37 |
| 45009.791666666664 | 5.71 |
| 45009.802083333336 | 10.85 |
| 45009.8125 | 99.96 |
| 45009.822916666664 | 41.88 |
| 45009.833333333336 | 179.36 |
| 45009.84375 | 5.39 |
| 45009.854166666664 | 5.89 |
| 45009.864583333336 | 8.73 |
| 45009.875 | 6.31 |
| 45009.885416666664 | 61.06 |
| 45009.895833333336 | 12.18 |
| 45009.90625 | 7.21 |
| 45009.916666666664 | 7.92 |
| 45009.927083333336 | 6.92 |
| 45009.9375 | 6.59 |
| 45009.947916666664 | 6.78 |
| 45009.958333333336 | 6.2 |
| 45009.96875 | 5.27 |
| 45009.979166666664 | 5.75 |
| 45009.989583333336 | 4.73 |
| 45010.0 | 4.2 |
| 45010.010416666664 | 4.24 |
| 45010.020833333336 | 3.97 |
| 45010.03125 | 4.36 |
| 45010.041666666664 | 3.3 |
| 45010.052083333336 | 3.31 |
| 45010.0625 | 3.09 |
| 45010.072916666664 | 3.07 |
| 45010.083333333336 | 3.37 |
| 45010.09375 | 3.52 |
| 45010.104166666664 | 3.13 |
| 45010.114583333336 | 3.83 |
| 45010.125 | 3.54 |
| 45010.135416666664 | 3.48 |
| 45010.145833333336 | 3.42 |
| 45010.15625 | 3.09 |
| 45010.166666666664 | 4.21 |
| 45010.177083333336 | 3.48 |
| 45010.1875 | 3.29 |
| 45010.197916666664 | 120.94 |
| 45010.208333333336 | 3.11 |
| 45010.21875 | 3 |
| 45010.229166666664 | 2.49 |
| 45010.239583333336 | 2.82 |
| 45010.25 | 2.52 |
| 45010.260416666664 | 2.9 |
| 45010.270833333336 | 2.82 |
| 45010.28125 | 3.16 |
| 45010.291666666664 | 3.54 |
| 45010.302083333336 | 3.57 |
| 45010.3125 | 3.6 |
| 45010.322916666664 | 3.01 |
| 45010.333333333336 | 3.41 |
| 45010.34375 | 11.96 |
| 45010.354166666664 | 4.55 |
| 45010.364583333336 | 4.8 |
| 45010.375 | 5.45 |
| 45010.385416666664 | 5.87 |
| 45010.395833333336 | 6.12 |
| 45010.40625 | 5.95 |
| 45010.416666666664 | 5.86 |
| 45010.427083333336 | 5.3 |
| 45010.4375 | 5.79 |
| 45010.447916666664 | 5.54 |
| 45010.458333333336 | 5.69 |
| 45010.46875 | 5.09 |
| 45010.479166666664 | 4.92 |
| 45010.489583333336 | 4.96 |
| 45010.5 | 5.02 |
| 45010.510416666664 | 4.32 |
| 45010.520833333336 | 4.24 |
| 45010.53125 | 4.11 |
| 45010.541666666664 | 3.71 |
| 45010.552083333336 | 3.61 |
| 45010.5625 | 3.15 |
| 45010.572916666664 | 3.09 |
| 45010.583333333336 | 2.97 |
| 45010.59375 | 2.44 |
| 45010.604166666664 | 2.87 |
| 45010.614583333336 | 2.93 |
| 45010.625 | 1.77 |
| 45010.635416666664 | 5.24 |
| 45010.645833333336 | 28.31 |
| 45010.65625 | 419.51 |
| 45010.666666666664 | 5.8 |
| 45010.677083333336 | 7.74 |
| 45010.6875 | 2.65 |
| 45010.697916666664 | 2.62 |
| 45010.708333333336 | 2.9 |
| 45010.71875 | 2.93 |
| 45010.729166666664 | 2.91 |
| 45010.739583333336 | 2.99 |
| 45010.75 | 3.26 |
| 45010.760416666664 | 3.14 |
| 45010.770833333336 | 3.39 |
| 45010.78125 | 4.16 |
| 45010.791666666664 | 512.05 |
| 45010.802083333336 | 514.47 |
| 45010.8125 | 10.22 |
| 45010.822916666664 | 12.51 |
| 45010.833333333336 | 11.31 |
| 45010.84375 | 10.72 |
| 45010.854166666664 | 240.08 |
| 45010.864583333336 | 160.48 |
| 45010.875 | 34.6 |
| 45010.885416666664 | 9.01 |
| 45010.895833333336 | 23.58 |
| 45010.90625 | 35.35 |
| 45010.916666666664 | 13.38 |
| 45010.927083333336 | 8.37 |
| 45010.9375 | 7.27 |
| 45010.947916666664 | 5.47 |
| 45010.958333333336 | 5.43 |
| 45010.96875 | 5.93 |
| 45010.979166666664 | 4.88 |
| 45010.989583333336 | 5.29 |
| 45011.0 | 4.14 |
| 45011.010416666664 | 3.93 |
| 45011.020833333336 | 4.03 |
| 45011.03125 | 3.9 |
| 45011.041666666664 | 3.16 |
| 45011.052083333336 | 2.68 |
| 45011.0625 | 2.67 |
| 45011.072916666664 | 2.14 |
| 45011.083333333336 | 2.69 |
| 45011.09375 | 1.34 |
| 45011.104166666664 | 1.4 |
| 45011.114583333336 | 3.24 |
| 45011.125 | 2.71 |
| 45011.135416666664 | 20.64 |
| 45011.145833333336 | 5.01 |
| 45011.15625 | 3.32 |
| 45011.166666666664 | 3.86 |
| 45011.177083333336 | 4.19 |
| 45011.1875 | 4.17 |
| 45011.197916666664 | 8.01 |
| 45011.208333333336 | 3.82 |
| 45011.21875 | 4.21 |
| 45011.229166666664 | 7.77 |
| 45011.239583333336 | 5.08 |
| 45011.25 | 18.52 |
| 45011.260416666664 | 18.32 |
| 45011.270833333336 | 27.58 |
| 45011.28125 | 17.11 |
| 45011.291666666664 | 6.46 |
| 45011.302083333336 | 32.87 |
| 45011.3125 | 38.5 |
| 45011.322916666664 | 25.11 |
| 45011.333333333336 | 10.35 |
| 45011.34375 | 10.28 |
| 45011.354166666664 | 17.18 |
| 45011.364583333336 | 24.58 |
| 45011.375 | 7.28 |
| 45011.385416666664 | 51.74 |
| 45011.395833333336 | 12.13 |
| 45011.40625 | 10.87 |
| 45011.416666666664 | 25.21 |
| 45011.427083333336 | 22.18 |
| 45011.4375 | 9.94 |
| 45011.447916666664 | 28.61 |
| 45011.458333333336 | 75.2 |
| 45011.46875 | 19.72 |
| 45011.479166666664 | 11.81 |
| 45011.489583333336 | 4.03 |
| 45011.5 | 3.79 |
| 45011.510416666664 | 4.78 |
| 45011.520833333336 | 3.57 |
| 45011.53125 | 4.56 |
| 45011.541666666664 | 2.48 |
| 45011.552083333336 | 3.02 |
| 45011.5625 | 2.02 |
| 45011.572916666664 | 3.04 |
| 45011.583333333336 | 3.05 |
| 45011.59375 | 2.59 |
| 45011.604166666664 | 3 |
| 45011.614583333336 | 2.53 |
| 45011.625 | 1.56 |
| 45011.635416666664 | 1.46 |
| 45011.645833333336 | 3.99 |
| 45011.65625 | 0.96 |
| 45011.666666666664 | 1.26 |
| 45011.677083333336 | 1.49 |
| 45011.6875 | 0.39 |
| 45011.697916666664 | 0.27 |
| 45011.708333333336 | -0.65 |
| 45011.71875 | -0.16 |
| 45011.729166666664 | -0.03 |
| 45011.739583333336 | -0.01 |
| 45011.75 | 0.14 |
| 45011.760416666664 | 2.86 |
| 45011.770833333336 | 2.81 |
| 45011.78125 | 9.23 |
| 45011.791666666664 | 9.9 |
| 45011.802083333336 | 8.6 |
| 45011.8125 | 10.37 |
| 45011.822916666664 | 10.39 |
| 45011.833333333336 | 8 |
| 45011.84375 | 8.59 |
| 45011.854166666664 | 8.64 |
| 45011.864583333336 | 15.02 |
| 45011.875 | 10.08 |
| 45011.885416666664 | 10.06 |
| 45011.895833333336 | 10.97 |
| 45011.90625 | 11.32 |
| 45011.916666666664 | 12.33 |
| 45011.927083333336 | 8.9 |
| 45011.9375 | 10.36 |
| 45011.947916666664 | 11.77 |
| 45011.958333333336 | 12.84 |
| 45011.96875 | 8.15 |
| 45011.979166666664 | 9.58 |
| 45011.989583333336 | 9.83 |
| 45012.0 | 7.7 |
| 45012.010416666664 | 7.12 |
| 45012.020833333336 | 4.81 |
| 45012.03125 | 4.43 |
| 45012.041666666664 | 2.91 |
| 45012.052083333336 | 2.49 |
| 45012.0625 | 0.69 |
| 45012.072916666664 | 1.37 |
| 45012.083333333336 | 1.43 |
| 45012.09375 | 3.16 |
| 45012.104166666664 | 3.16 |
| 45012.114583333336 | 2.83 |
| 45012.125 | 2.6 |
| 45012.135416666664 | 3.27 |
| 45012.145833333336 | 2.47 |
| 45012.15625 | 2.8 |
| 45012.166666666664 | 2 |
| 45012.177083333336 | 3.04 |
| 45012.1875 | 3.09 |
| 45012.197916666664 | 2.93 |
| 45012.208333333336 | 2.34 |
| 45012.21875 | 2.84 |
| 45012.229166666664 | 2.39 |
| 45012.239583333336 | 2.59 |
| 45012.25 | 2.31 |
| 45012.260416666664 | 3.05 |
| 45012.270833333336 | 2.31 |
| 45012.28125 | 2.54 |
| 45012.291666666664 | 2.02 |
| 45012.302083333336 | 2.82 |
| 45012.3125 | 3.08 |
| 45012.322916666664 | 2.76 |
| 45012.333333333336 | 3.46 |
| 45012.34375 | 2.38 |
| 45012.354166666664 | 3.35 |
| 45012.364583333336 | 3.91 |
| 45012.375 | 2.91 |
| 45012.385416666664 | 2.96 |
| 45012.395833333336 | 3.03 |
| 45012.40625 | 2.53 |
| 45012.416666666664 | 3.23 |
| 45012.427083333336 | 3.24 |
| 45012.4375 | 3.25 |
| 45012.447916666664 | 0.59 |
| 45012.458333333336 | 1.14 |
| 45012.46875 | 1.8 |
| 45012.479166666664 | 3.05 |
| 45012.489583333336 | 3.11 |
| 45012.5 | 2.38 |
| 45012.510416666664 | 2.1 |
| 45012.520833333336 | 2.38 |
| 45012.53125 | 2.17 |
| 45012.541666666664 | 2.19 |
| 45012.552083333336 | 1.09 |
| 45012.5625 | 0.91 |
| 45012.572916666664 | -0.35 |
| 45012.583333333336 | 0.84 |
| 45012.59375 | 1.42 |
| 45012.604166666664 | 1.18 |
| 45012.614583333336 | 0.99 |
| 45012.625 | 1.07 |
| 45012.635416666664 | 1.19 |
| 45012.645833333336 | 0.46 |
| 45012.65625 | 0.69 |
| 45012.666666666664 | 0.63 |
| 45012.677083333336 | 1.64 |
| 45012.6875 | 1.01 |
| 45012.697916666664 | 1.2 |
| 45012.708333333336 | 0.73 |
| 45012.71875 | 0.54 |
| 45012.729166666664 | 0.59 |
| 45012.739583333336 | 0.89 |
| 45012.75 | 0.65 |
| 45012.760416666664 | 0.74 |
| 45012.770833333336 | 0.35 |
| 45012.78125 | 0.45 |
| 45012.791666666664 | 0.97 |
| 45012.802083333336 | 0.64 |
| 45012.8125 | 0.65 |
| 45012.822916666664 | 2.46 |
| 45012.833333333336 | 2.05 |
| 45012.84375 | 2.53 |
| 45012.854166666664 | 2.1 |
| 45012.864583333336 | 3.02 |
| 45012.875 | 3.09 |
| 45012.885416666664 | 3.26 |
| 45012.895833333336 | 3.57 |
| 45012.90625 | 4 |
| 45012.916666666664 | 4.04 |
| 45012.927083333336 | 3.33 |
| 45012.9375 | 4 |
| 45012.947916666664 | 3.92 |
| 45012.958333333336 | 4.41 |
| 45012.96875 | 4.4 |
| 45012.979166666664 | 6.35 |
| 45012.989583333336 | 6.51 |
| 45013.0 | 7.32 |
| 45013.010416666664 | 6.46 |
| 45013.020833333336 | 6.51 |
| 45013.03125 | 5.57 |
| 45013.041666666664 | 4.18 |
| 45013.052083333336 | 4.06 |
| 45013.0625 | 4.46 |
| 45013.072916666664 | 3.54 |
| 45013.083333333336 | 3.53 |
| 45013.09375 | 2.88 |
| 45013.104166666664 | 3.08 |
| 45013.114583333336 | 2.71 |
| 45013.125 | 2.88 |
| 45013.135416666664 | 2.26 |
| 45013.145833333336 | 2.55 |
| 45013.15625 | 1.99 |
| 45013.166666666664 | 2.03 |
| 45013.177083333336 | 2.01 |
| 45013.1875 | 2.09 |
| 45013.197916666664 | 1.85 |
| 45013.208333333336 | 1.99 |
| 45013.21875 | 1.95 |
| 45013.229166666664 | 1.82 |
| 45013.239583333336 | 1.99 |
| 45013.25 | 2.22 |
| 45013.260416666664 | 2.15 |
| 45013.270833333336 | 2.42 |
| 45013.28125 | 2.32 |
| 45013.291666666664 | 2.54 |
| 45013.302083333336 | 2.33 |
| 45013.3125 | 1.98 |
| 45013.322916666664 | 1.85 |
| 45013.333333333336 | 1.86 |
| 45013.34375 | 2.14 |
| 45013.354166666664 | 1.9 |
| 45013.364583333336 | 2.02 |
| 45013.375 | 2.03 |
| 45013.385416666664 | 2.12 |
| 45013.395833333336 | 1.98 |
| 45013.40625 | 2.36 |
| 45013.416666666664 | 2.44 |
| 45013.427083333336 | 2.2 |
| 45013.4375 | 2.3 |
| 45013.447916666664 | 2.39 |
| 45013.458333333336 | 2.38 |
| 45013.46875 | 2.27 |
| 45013.479166666664 | 2.17 |
| 45013.489583333336 | 2.45 |
| 45013.5 | 2.39 |
| 45013.510416666664 | 2.79 |
| 45013.520833333336 | 3.12 |
| 45013.53125 | 2.68 |
| 45013.541666666664 | 3.61 |
| 45013.552083333336 | 2.5 |
| 45013.5625 | 2.9 |
| 45013.572916666664 | 2.74 |
| 45013.583333333336 | 2.55 |
| 45013.59375 | 1.92 |
| 45013.604166666664 | 2.14 |
| 45013.614583333336 | 1.85 |
| 45013.625 | 1.81 |
| 45013.635416666664 | 1.34 |
| 45013.645833333336 | 1.15 |
| 45013.65625 | 1.37 |
| 45013.666666666664 | 1.79 |
| 45013.677083333336 | 1.43 |
| 45013.6875 | 1.56 |
| 45013.697916666664 | 1.26 |
| 45013.708333333336 | 1.19 |
| 45013.71875 | 0.98 |
| 45013.729166666664 | 1.25 |
| 45013.739583333336 | 1.41 |
| 45013.75 | 1.21 |
| 45013.760416666664 | 1.58 |
| 45013.770833333336 | 1.45 |
| 45013.78125 | 1.45 |
| 45013.791666666664 | 1.49 |
| 45013.802083333336 | 1.29 |
| 45013.8125 | 1.47 |
| 45013.822916666664 | 1.28 |
| 45013.833333333336 | 1.95 |
| 45013.84375 | 1.8 |
| 45013.854166666664 | 2.06 |
| 45013.864583333336 | 1.95 |
| 45013.875 | 1.94 |
| 45013.885416666664 | 2.39 |
| 45013.895833333336 | 2.23 |
| 45013.90625 | 2.85 |
| 45013.916666666664 | 2.75 |
| 45013.927083333336 | 2.58 |
| 45013.9375 | 3.01 |
| 45013.947916666664 | 3.19 |
| 45013.958333333336 | 3.04 |
| 45013.96875 | 3.16 |
| 45013.979166666664 | 3.15 |
| 45013.989583333336 | 3.62 |
| 45014.0 | 3.99 |
| 45014.010416666664 | 3.78 |
| 45014.020833333336 | 4.39 |
| 45014.03125 | 4.43 |
| 45014.041666666664 | 4.26 |
| 45014.052083333336 | 4.25 |
| 45014.0625 | 4.56 |
| 45014.072916666664 | 4.7 |
| 45014.083333333336 | 3.79 |
| 45014.09375 | 3.88 |
| 45014.104166666664 | 3.73 |
| 45014.114583333336 | 3.49 |
| 45014.125 | 3.19 |
| 45014.135416666664 | 2.7 |
| 45014.145833333336 | 2.65 |
| 45014.15625 | 2.3 |
| 45014.166666666664 | 2.46 |
| 45014.177083333336 | 2.18 |
| 45014.1875 | 1.91 |
| 45014.197916666664 | 2.07 |
| 45014.208333333336 | 2.24 |
| 45014.21875 | 1.96 |
| 45014.229166666664 | 1.78 |
| 45014.239583333336 | 2.21 |
| 45014.25 | 1.19 |
| 45014.260416666664 | 518.69 |
| 45014.270833333336 | 2.53 |
| 45014.28125 | 2.2 |
| 45014.291666666664 | 1.98 |
| 45014.302083333336 | 2.03 |
| 45014.3125 | 2.14 |
| 45014.322916666664 | 1.65 |
| 45014.333333333336 | 1.51 |
| 45014.34375 | 1.71 |
| 45014.354166666664 | 1.95 |
| 45014.364583333336 | 1.51 |
| 45014.375 | 1.94 |
| 45014.385416666664 | 1.86 |
| 45014.395833333336 | 1.79 |
| 45014.40625 | 1.91 |
| 45014.416666666664 | 1.86 |
| 45014.427083333336 | 2.06 |
| 45014.4375 | 2.08 |
| 45014.447916666664 | 2.15 |
| 45014.458333333336 | 1.84 |
| 45014.46875 | 1.71 |
| 45014.479166666664 | 1.93 |
| 45014.489583333336 | 2.15 |
| 45014.5 | 2.44 |
| 45014.510416666664 | 2.26 |
| 45014.520833333336 | 2.52 |
| 45014.53125 | 2.05 |
| 45014.541666666664 | 1.94 |
| 45014.552083333336 | 1.95 |
| 45014.5625 | 1.87 |
| 45014.572916666664 | 2.3 |
| 45014.583333333336 | 2.19 |
| 45014.59375 | 1.67 |
| 45014.604166666664 | 1.94 |
| 45014.614583333336 | 1.82 |
| 45014.625 | 1.19 |
| 45014.635416666664 | 1.38 |
| 45014.645833333336 | 1.51 |
| 45014.65625 | 1.54 |
| 45014.666666666664 | 1.47 |
| 45014.677083333336 | 1.21 |
| 45014.6875 | 0.76 |
| 45014.697916666664 | 0.7 |
| 45014.708333333336 | 0.76 |
| 45014.71875 | 1.28 |
| 45014.729166666664 | 1.02 |
| 45014.739583333336 | 1.38 |
| 45014.75 | 0.63 |
| 45014.760416666664 | 1.01 |
| 45014.770833333336 | 1.12 |
| 45014.78125 | 1.05 |
| 45014.791666666664 | 1.04 |
| 45014.802083333336 | 1.18 |
| 45014.8125 | 1.33 |
| 45014.822916666664 | 1.19 |
| 45014.833333333336 | 1.25 |
| 45014.84375 | 1.24 |
| 45014.854166666664 | 1.41 |
| 45014.864583333336 | 1.57 |
| 45014.875 | 1.72 |
| 45014.885416666664 | 1.69 |
| 45014.895833333336 | 1.7 |
| 45014.90625 | 1.91 |
| 45014.916666666664 | 1.71 |
| 45014.927083333336 | 2.07 |
| 45014.9375 | 2.09 |
| 45014.947916666664 | 2.07 |
| 45014.958333333336 | 1.96 |
| 45014.96875 | 2.51 |
| 45014.979166666664 | 2.73 |
| 45014.989583333336 | 2.88 |
| 45015.0 | 2.87 |
| 45015.010416666664 | 3.36 |
| 45015.020833333336 | 3.37 |
| 45015.03125 | 3.17 |
| 45015.041666666664 | 3.81 |
| 45015.052083333336 | 3.98 |
| 45015.0625 | 3.45 |
| 45015.072916666664 | 3.32 |
| 45015.083333333336 | 3.69 |
| 45015.09375 | 3.42 |
| 45015.104166666664 | 3.14 |
| 45015.114583333336 | 2.65 |
| 45015.125 | 2.54 |
| 45015.135416666664 | 2.33 |
| 45015.145833333336 | 2.17 |
| 45015.15625 | 1.77 |
| 45015.166666666664 | 2.12 |
| 45015.177083333336 | 1.88 |
| 45015.1875 | 2.18 |
| 45015.197916666664 | 2.78 |
| 45015.208333333336 | 5.14 |
| 45015.21875 | 8.39 |
| 45015.229166666664 | 98.66 |
| 45015.239583333336 | 364.57 |
| 45015.25 | 192.74 |
| 45015.260416666664 | 19.99 |
| 45015.270833333336 | 133.41 |
| 45015.28125 | 94.36 |
| 45015.291666666664 | 58.83 |
| 45015.302083333336 | 62.74 |
| 45015.3125 | 40.72 |
| 45015.322916666664 | 11.75 |
| 45015.333333333336 | 9.78 |
| 45015.34375 | 11.31 |
| 45015.354166666664 | 2.67 |
| 45015.364583333336 | 4.07 |
| 45015.375 | 1.1 |
| 45015.385416666664 | 1.32 |
| 45015.395833333336 | 1.46 |
| 45015.40625 | 1.73 |
| 45015.416666666664 | 1.58 |
| 45015.427083333336 | 1.49 |
| 45015.4375 | 1.55 |
| 45015.447916666664 | 1.9 |
| 45015.458333333336 | 1.35 |
| 45015.46875 | 1.21 |
| 45015.479166666664 | 1.27 |
| 45015.489583333336 | 1.94 |
| 45015.5 | 1.83 |
| 45015.510416666664 | 2.3 |
| 45015.520833333336 | 2 |
| 45015.53125 | 1.95 |
| 45015.541666666664 | 1.67 |
| 45015.552083333336 | 2.06 |
| 45015.5625 | 2.13 |
| 45015.572916666664 | 2.02 |
| 45015.583333333336 | 1.93 |
| 45015.59375 | 2.08 |
| 45015.604166666664 | 2.02 |
| 45015.614583333336 | 2.13 |
| 45015.625 | 1.88 |
| 45015.635416666664 | 1.94 |
| 45015.645833333336 | 1.6 |
| 45015.65625 | 1.87 |
| 45015.666666666664 | 1.39 |
| 45015.677083333336 | 1.67 |
| 45015.6875 | 1.1 |
| 45015.697916666664 | 1.28 |
| 45015.708333333336 | 1.12 |
| 45015.71875 | 1.18 |
| 45015.729166666664 | 1.1 |
| 45015.739583333336 | 1.42 |
| 45015.75 | 1.3 |
| 45015.760416666664 | 1.09 |
| 45015.770833333336 | 1 |
| 45015.78125 | 1.3 |
| 45015.791666666664 | 1 |
| 45015.802083333336 | 1.23 |
| 45015.8125 | 1.15 |
| 45015.822916666664 | 1.12 |
| 45015.833333333336 | 1.13 |
| 45015.84375 | 1.29 |
| 45015.854166666664 | 1.08 |
| 45015.864583333336 | 1.13 |
| 45015.875 | 1.38 |
| 45015.885416666664 | 1.48 |
| 45015.895833333336 | 1.99 |
| 45015.90625 | 1.89 |
| 45015.916666666664 | 1.66 |
| 45015.927083333336 | 1.88 |
| 45015.9375 | 2.16 |
| 45015.947916666664 | 2.19 |
| 45015.958333333336 | 1.91 |
| 45015.96875 | 2.05 |
| 45015.979166666664 | 2.03 |
| 45015.989583333336 | 2.28 |
| 45016.0 | 2.64 |
| 45016.010416666664 | 2.86 |
| 45016.020833333336 | 2.9 |
| 45016.03125 | 2.98 |
| 45016.041666666664 | 3.05 |
| 45016.052083333336 | 3.18 |
| 45016.0625 | 3.25 |
| 45016.072916666664 | 3.48 |
| 45016.083333333336 | 3.43 |
| 45016.09375 | 4.39 |
| 45016.104166666664 | 4.11 |
| 45016.114583333336 | 5.09 |
| 45016.125 | 5.12 |
| 45016.135416666664 | 4.07 |
| 45016.145833333336 | 3.89 |
| 45016.15625 | 3.3 |
| 45016.166666666664 | 4.09 |
| 45016.177083333336 | 3.11 |
| 45016.1875 | 3.11 |
| 45016.197916666664 | 2.61 |
| 45016.208333333336 | 2.59 |
| 45016.21875 | 2.29 |
| 45016.229166666664 | 1.99 |
| 45016.239583333336 | 4.09 |
| 45016.25 | 4.1 |
| 45016.260416666664 | 3.96 |
| 45016.270833333336 | 4.64 |
| 45016.28125 | 3.42 |
| 45016.291666666664 | 2.19 |
| 45016.302083333336 | 2.55 |
| 45016.3125 | 2.81 |
| 45016.322916666664 | 3.4 |
| 45016.333333333336 | 1.31 |
| 45016.34375 | 1.44 |
| 45016.354166666664 | 1.19 |
| 45016.364583333336 | 1.14 |
| 45016.375 | 1.14 |
| 45016.385416666664 | 0.97 |
| 45016.395833333336 | 1.33 |
| 45016.40625 | 1.03 |
| 45016.416666666664 | 1.44 |
| 45016.427083333336 | 1.28 |
| 45016.4375 | 1.02 |
| 45016.447916666664 | 0.89 |
| 45016.458333333336 | 1.34 |
| 45016.46875 | 1.43 |
| 45016.479166666664 | 1.17 |
| 45016.489583333336 | 1.58 |
| 45016.5 | 1.58 |
| 45016.510416666664 | 1.61 |
| 45016.520833333336 | 1.77 |
| 45016.53125 | 1.19 |
| 45016.541666666664 | 1.4 |
| 45016.552083333336 | 1.83 |
| 45016.5625 | 1.44 |
| 45016.572916666664 | 1.42 |
| 45016.583333333336 | 1.65 |
| 45016.59375 | 1.68 |
| 45016.604166666664 | 1.7 |
| 45016.614583333336 | 1.55 |
| 45016.625 | 1.55 |
| 45016.635416666664 | 1.88 |
| 45016.645833333336 | 2.15 |
| 45016.65625 | 1.95 |
| 45016.666666666664 | 1.97 |
| 45016.677083333336 | 2.06 |
| 45016.6875 | 2.02 |
| 45016.697916666664 | 2.43 |
| 45016.708333333336 | 2.56 |
| 45016.71875 | 1.98 |
| 45016.729166666664 | 1.54 |
| 45016.739583333336 | 1.25 |
| 45016.75 | 1.58 |
| 45016.760416666664 | 1.34 |
| 45016.770833333336 | 1.53 |
| 45016.78125 | 1.61 |
| 45016.791666666664 | 1.6 |
| 45016.802083333336 | 2.08 |
| 45016.8125 | 3.21 |
| 45016.822916666664 | 1.51 |
| 45016.833333333336 | 1.46 |
| 45016.84375 | 1.59 |
| 45016.854166666664 | 1.16 |
| 45016.864583333336 | 1.42 |
| 45016.875 | 1.67 |
| 45016.885416666664 | 1.42 |
| 45016.895833333336 | 1.24 |
| 45016.90625 | 1.39 |
| 45016.916666666664 | 1.79 |
| 45016.927083333336 | 1.12 |
| 45016.9375 | 1.03 |
| 45016.947916666664 | 1.34 |
| 45016.958333333336 | 1.69 |
| 45016.96875 | 1.55 |
| 45016.979166666664 | 1.89 |
| 45016.989583333336 | 2.19 |
| 45017.0 | 1.89 |
| 45017.010416666664 | 1.81 |
| 45017.020833333336 | 1.55 |
| 45017.03125 | 2.1 |
| 45017.041666666664 | 1.85 |
| 45017.052083333336 | 2.36 |
| 45017.0625 | 2.74 |
| 45017.072916666664 | 3.47 |
| 45017.083333333336 | 4.07 |
| 45017.09375 | 4.13 |
| 45017.104166666664 | 4.05 |
| 45017.114583333336 | 4.65 |
| 45017.125 | 4.91 |
| 45017.135416666664 | 4.88 |
| 45017.145833333336 | 4.54 |